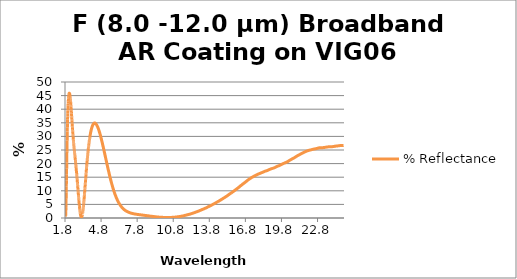
| Category | % Reflectance |
|---|---|
| 1.8 | 8.176 |
| 1.8045 | 6.008 |
| 1.809 | 6.008 |
| 1.8135 | 4.145 |
| 1.818 | 4.145 |
| 1.8225 | 2.639 |
| 1.827 | 2.639 |
| 1.8315 | 1.541 |
| 1.836 | 0.876 |
| 1.8405 | 0.876 |
| 1.845 | 0.646 |
| 1.8495 | 0.646 |
| 1.854 | 0.863 |
| 1.8585 | 0.863 |
| 1.863 | 1.5 |
| 1.8675 | 1.5 |
| 1.872 | 2.515 |
| 1.8765 | 3.852 |
| 1.881 | 3.852 |
| 1.8855 | 5.462 |
| 1.89 | 5.462 |
| 1.8945 | 7.306 |
| 1.899 | 7.306 |
| 1.9035 | 9.318 |
| 1.908 | 11.457 |
| 1.9125 | 11.457 |
| 1.917 | 13.661 |
| 1.9215 | 13.661 |
| 1.926 | 15.895 |
| 1.9305 | 15.895 |
| 1.935 | 18.127 |
| 1.9395 | 18.127 |
| 1.944 | 20.324 |
| 1.9485 | 22.457 |
| 1.953 | 22.457 |
| 1.9575 | 24.517 |
| 1.962 | 24.517 |
| 1.9665 | 26.492 |
| 1.971 | 26.492 |
| 1.9755 | 28.361 |
| 1.98 | 28.361 |
| 1.9845 | 30.129 |
| 1.989 | 31.787 |
| 1.9935 | 31.787 |
| 1.998 | 33.334 |
| 2.0025 | 33.334 |
| 2.007 | 34.782 |
| 2.0115 | 34.782 |
| 2.016 | 36.117 |
| 2.0205 | 37.343 |
| 2.025 | 37.343 |
| 2.0295 | 38.48 |
| 2.034 | 38.48 |
| 2.0385 | 39.507 |
| 2.043 | 39.507 |
| 2.0475 | 40.433 |
| 2.052 | 40.433 |
| 2.0565 | 41.287 |
| 2.061 | 42.053 |
| 2.0655 | 42.053 |
| 2.07 | 42.732 |
| 2.0745 | 42.732 |
| 2.079 | 43.341 |
| 2.0835 | 43.341 |
| 2.088 | 43.875 |
| 2.0925 | 43.875 |
| 2.097 | 44.337 |
| 2.1015 | 44.737 |
| 2.106 | 44.737 |
| 2.1105 | 45.065 |
| 2.115 | 45.065 |
| 2.1195 | 45.333 |
| 2.124 | 45.333 |
| 2.1285 | 45.549 |
| 2.133 | 45.549 |
| 2.1375 | 45.705 |
| 2.142 | 45.807 |
| 2.1465 | 45.807 |
| 2.151 | 45.859 |
| 2.1555 | 45.859 |
| 2.16 | 45.872 |
| 2.1645 | 45.872 |
| 2.169 | 45.84 |
| 2.1735 | 45.766 |
| 2.178 | 45.766 |
| 2.1825 | 45.649 |
| 2.187 | 45.649 |
| 2.1915 | 45.497 |
| 2.196 | 45.497 |
| 2.2005 | 45.314 |
| 2.205 | 45.314 |
| 2.2095 | 45.088 |
| 2.214 | 44.831 |
| 2.2185 | 44.831 |
| 2.223 | 44.545 |
| 2.2275 | 44.545 |
| 2.232 | 44.236 |
| 2.2365 | 44.236 |
| 2.241 | 43.904 |
| 2.2455 | 43.904 |
| 2.25 | 43.532 |
| 2.2545 | 43.142 |
| 2.259 | 43.142 |
| 2.2635 | 42.739 |
| 2.268 | 42.739 |
| 2.2725 | 42.312 |
| 2.277 | 42.312 |
| 2.2815 | 41.869 |
| 2.286 | 41.869 |
| 2.2905 | 41.413 |
| 2.295 | 40.936 |
| 2.2995 | 40.936 |
| 2.304 | 40.444 |
| 2.3085 | 40.444 |
| 2.313 | 39.944 |
| 2.3175 | 39.944 |
| 2.322 | 39.434 |
| 2.3265 | 38.918 |
| 2.331 | 38.918 |
| 2.3355 | 38.397 |
| 2.34 | 38.397 |
| 2.3445 | 37.876 |
| 2.349 | 37.876 |
| 2.3535 | 37.352 |
| 2.358 | 37.352 |
| 2.3625 | 36.82 |
| 2.367 | 36.288 |
| 2.3715 | 36.288 |
| 2.376 | 35.758 |
| 2.3805 | 35.758 |
| 2.385 | 35.231 |
| 2.3895 | 35.231 |
| 2.394 | 34.71 |
| 2.3985 | 34.71 |
| 2.403 | 34.192 |
| 2.4075 | 33.676 |
| 2.412 | 33.676 |
| 2.4165 | 33.169 |
| 2.421 | 33.169 |
| 2.4255 | 32.67 |
| 2.43 | 32.67 |
| 2.4345 | 32.178 |
| 2.439 | 32.178 |
| 2.4435 | 31.693 |
| 2.448 | 31.218 |
| 2.4525 | 31.218 |
| 2.457 | 30.751 |
| 2.4615 | 30.751 |
| 2.466 | 30.29 |
| 2.4705 | 30.29 |
| 2.475 | 29.841 |
| 2.4795 | 29.403 |
| 2.484 | 29.403 |
| 2.4885 | 28.973 |
| 2.493 | 28.973 |
| 2.4975 | 28.553 |
| 2.502 | 28.553 |
| 2.5065 | 28.14 |
| 2.511 | 28.14 |
| 2.5155 | 27.738 |
| 2.52 | 27.344 |
| 2.5245 | 27.344 |
| 2.529 | 26.956 |
| 2.5335 | 26.956 |
| 2.538 | 26.578 |
| 2.5425 | 26.578 |
| 2.547 | 26.21 |
| 2.5515 | 26.21 |
| 2.556 | 25.845 |
| 2.5605 | 25.482 |
| 2.565 | 25.482 |
| 2.5695 | 25.127 |
| 2.574 | 25.127 |
| 2.5785 | 24.782 |
| 2.583 | 24.782 |
| 2.5875 | 24.435 |
| 2.592 | 24.084 |
| 2.5965 | 24.084 |
| 2.601 | 23.74 |
| 2.6055 | 23.74 |
| 2.61 | 23.404 |
| 2.6145 | 23.404 |
| 2.619 | 23.064 |
| 2.6235 | 23.064 |
| 2.628 | 22.725 |
| 2.6325 | 22.384 |
| 2.637 | 22.384 |
| 2.6415 | 22.038 |
| 2.646 | 22.038 |
| 2.6505 | 21.698 |
| 2.655 | 21.698 |
| 2.6595 | 21.368 |
| 2.664 | 21.368 |
| 2.6685 | 21.024 |
| 2.673 | 20.661 |
| 2.6775 | 20.661 |
| 2.682 | 20.3 |
| 2.6865 | 20.3 |
| 2.691 | 19.932 |
| 2.6955 | 19.932 |
| 2.7 | 19.556 |
| 2.7045 | 19.556 |
| 2.709 | 19.181 |
| 2.7135 | 18.811 |
| 2.718 | 18.811 |
| 2.7225 | 18.431 |
| 2.727 | 18.431 |
| 2.7315 | 18.051 |
| 2.736 | 18.051 |
| 2.7405 | 17.668 |
| 2.745 | 17.28 |
| 2.7495 | 17.28 |
| 2.754 | 16.893 |
| 2.7585 | 16.893 |
| 2.763 | 16.5 |
| 2.7675 | 16.5 |
| 2.772 | 16.098 |
| 2.7765 | 16.098 |
| 2.781 | 15.693 |
| 2.7855 | 15.28 |
| 2.79 | 15.28 |
| 2.7945 | 14.866 |
| 2.799 | 14.866 |
| 2.8035 | 14.45 |
| 2.808 | 14.45 |
| 2.8125 | 14.028 |
| 2.817 | 14.028 |
| 2.8215 | 13.606 |
| 2.826 | 13.178 |
| 2.8305 | 13.178 |
| 2.835 | 12.745 |
| 2.8395 | 12.745 |
| 2.844 | 12.314 |
| 2.8485 | 12.314 |
| 2.853 | 11.879 |
| 2.8575 | 11.879 |
| 2.862 | 11.441 |
| 2.8665 | 11.006 |
| 2.871 | 11.006 |
| 2.8755 | 10.566 |
| 2.88 | 10.566 |
| 2.8845 | 10.126 |
| 2.889 | 10.126 |
| 2.8935 | 9.69 |
| 2.898 | 9.253 |
| 2.9025 | 9.253 |
| 2.907 | 8.819 |
| 2.9115 | 8.819 |
| 2.916 | 8.389 |
| 2.9205 | 8.389 |
| 2.925 | 7.959 |
| 2.9295 | 7.959 |
| 2.934 | 7.534 |
| 2.9385 | 7.112 |
| 2.943 | 7.112 |
| 2.9475 | 6.7 |
| 2.952 | 6.7 |
| 2.9565 | 6.294 |
| 2.961 | 6.294 |
| 2.9655 | 5.89 |
| 2.97 | 5.89 |
| 2.9745 | 5.495 |
| 2.979 | 5.114 |
| 2.9835 | 5.114 |
| 2.988 | 4.738 |
| 2.9925 | 4.738 |
| 2.997 | 4.373 |
| 3.0015 | 4.373 |
| 3.006 | 4.023 |
| 3.0105 | 4.023 |
| 3.015 | 3.678 |
| 3.0195 | 3.349 |
| 3.024 | 3.349 |
| 3.0285 | 3.037 |
| 3.033 | 3.037 |
| 3.0375 | 2.735 |
| 3.042 | 2.735 |
| 3.0465 | 2.448 |
| 3.051 | 2.178 |
| 3.0555 | 2.178 |
| 3.06 | 1.923 |
| 3.0645 | 1.923 |
| 3.069 | 1.684 |
| 3.0735 | 1.684 |
| 3.078 | 1.461 |
| 3.0825 | 1.461 |
| 3.087 | 1.254 |
| 3.0915 | 1.071 |
| 3.096 | 1.071 |
| 3.1005 | 0.907 |
| 3.105 | 0.907 |
| 3.1095 | 0.758 |
| 3.114 | 0.758 |
| 3.1185 | 0.63 |
| 3.123 | 0.63 |
| 3.1275 | 0.521 |
| 3.132 | 0.432 |
| 3.1365 | 0.432 |
| 3.141 | 0.365 |
| 3.1455 | 0.365 |
| 3.15 | 0.319 |
| 3.1545 | 0.319 |
| 3.159 | 0.292 |
| 3.1635 | 0.292 |
| 3.168 | 0.283 |
| 3.1725 | 0.299 |
| 3.177 | 0.299 |
| 3.1815 | 0.34 |
| 3.186 | 0.34 |
| 3.1905 | 0.396 |
| 3.195 | 0.396 |
| 3.1995 | 0.471 |
| 3.204 | 0.57 |
| 3.2085 | 0.57 |
| 3.213 | 0.686 |
| 3.2175 | 0.686 |
| 3.222 | 0.824 |
| 3.2265 | 0.824 |
| 3.231 | 0.983 |
| 3.2355 | 0.983 |
| 3.24 | 1.157 |
| 3.2445 | 1.348 |
| 3.249 | 1.348 |
| 3.2535 | 1.559 |
| 3.258 | 1.559 |
| 3.2625 | 1.788 |
| 3.267 | 1.788 |
| 3.2715 | 2.035 |
| 3.276 | 2.035 |
| 3.2805 | 2.3 |
| 3.285 | 2.578 |
| 3.2895 | 2.578 |
| 3.294 | 2.868 |
| 3.2985 | 2.868 |
| 3.303 | 3.175 |
| 3.3075 | 3.175 |
| 3.312 | 3.499 |
| 3.3165 | 3.835 |
| 3.321 | 3.835 |
| 3.3255 | 4.181 |
| 3.33 | 4.181 |
| 3.3345 | 4.542 |
| 3.339 | 4.542 |
| 3.3435 | 4.915 |
| 3.348 | 4.915 |
| 3.3525 | 5.293 |
| 3.357 | 5.684 |
| 3.3615 | 5.684 |
| 3.366 | 6.086 |
| 3.3705 | 6.086 |
| 3.375 | 6.493 |
| 3.3795 | 6.493 |
| 3.384 | 6.907 |
| 3.3885 | 6.907 |
| 3.393 | 7.33 |
| 3.3975 | 7.761 |
| 3.402 | 7.761 |
| 3.4065 | 8.194 |
| 3.411 | 8.194 |
| 3.4155 | 8.627 |
| 3.42 | 8.627 |
| 3.4245 | 9.065 |
| 3.429 | 9.065 |
| 3.4335 | 9.507 |
| 3.438 | 9.957 |
| 3.4425 | 9.957 |
| 3.447 | 10.413 |
| 3.4515 | 10.413 |
| 3.456 | 10.872 |
| 3.4605 | 10.872 |
| 3.465 | 11.332 |
| 3.4695 | 11.793 |
| 3.474 | 11.793 |
| 3.4785 | 12.256 |
| 3.483 | 12.256 |
| 3.4875 | 12.717 |
| 3.492 | 12.717 |
| 3.4965 | 13.175 |
| 3.501 | 13.175 |
| 3.5055 | 13.631 |
| 3.51 | 14.085 |
| 3.5145 | 14.085 |
| 3.519 | 14.544 |
| 3.5235 | 14.544 |
| 3.528 | 15.002 |
| 3.5325 | 15.002 |
| 3.537 | 15.454 |
| 3.5415 | 15.454 |
| 3.546 | 15.902 |
| 3.5505 | 16.35 |
| 3.555 | 16.35 |
| 3.5595 | 16.8 |
| 3.564 | 16.8 |
| 3.5685 | 17.242 |
| 3.573 | 17.242 |
| 3.5775 | 17.68 |
| 3.582 | 17.68 |
| 3.5865 | 18.112 |
| 3.591 | 18.539 |
| 3.5955 | 18.539 |
| 3.6 | 18.966 |
| 3.6045 | 18.966 |
| 3.609 | 19.386 |
| 3.6135 | 19.386 |
| 3.618 | 19.798 |
| 3.6225 | 20.207 |
| 3.627 | 20.207 |
| 3.6315 | 20.614 |
| 3.636 | 20.614 |
| 3.6405 | 21.015 |
| 3.645 | 21.015 |
| 3.6495 | 21.406 |
| 3.654 | 21.406 |
| 3.6585 | 21.794 |
| 3.663 | 22.179 |
| 3.6675 | 22.179 |
| 3.672 | 22.553 |
| 3.6765 | 22.553 |
| 3.681 | 22.921 |
| 3.6855 | 22.921 |
| 3.69 | 23.29 |
| 3.6945 | 23.29 |
| 3.699 | 23.65 |
| 3.7035 | 24.003 |
| 3.708 | 24.003 |
| 3.7125 | 24.349 |
| 3.717 | 24.349 |
| 3.7215 | 24.689 |
| 3.726 | 24.689 |
| 3.7305 | 25.021 |
| 3.735 | 25.021 |
| 3.7395 | 25.345 |
| 3.744 | 25.667 |
| 3.7485 | 25.667 |
| 3.753 | 25.986 |
| 3.7575 | 25.986 |
| 3.762 | 26.297 |
| 3.7665 | 26.297 |
| 3.771 | 26.6 |
| 3.7755 | 26.894 |
| 3.78 | 26.894 |
| 3.7845 | 27.185 |
| 3.789 | 27.185 |
| 3.7935 | 27.472 |
| 3.798 | 27.472 |
| 3.8025 | 27.752 |
| 3.807 | 27.752 |
| 3.8115 | 28.023 |
| 3.816 | 28.285 |
| 3.8205 | 28.285 |
| 3.825 | 28.545 |
| 3.8295 | 28.545 |
| 3.834 | 28.804 |
| 3.8385 | 28.804 |
| 3.843 | 29.055 |
| 3.8475 | 29.055 |
| 3.852 | 29.294 |
| 3.8565 | 29.528 |
| 3.861 | 29.528 |
| 3.8655 | 29.759 |
| 3.87 | 29.759 |
| 3.8745 | 29.983 |
| 3.879 | 29.983 |
| 3.8835 | 30.202 |
| 3.888 | 30.418 |
| 3.8925 | 30.418 |
| 3.897 | 30.622 |
| 3.9015 | 30.622 |
| 3.906 | 30.821 |
| 3.9105 | 30.821 |
| 3.915 | 31.018 |
| 3.9195 | 31.018 |
| 3.924 | 31.208 |
| 3.9285 | 31.393 |
| 3.933 | 31.393 |
| 3.9375 | 31.572 |
| 3.942 | 31.572 |
| 3.9465 | 31.745 |
| 3.951 | 31.745 |
| 3.9555 | 31.913 |
| 3.96 | 31.913 |
| 3.9645 | 32.072 |
| 3.969 | 32.225 |
| 3.9735 | 32.225 |
| 3.978 | 32.378 |
| 3.9825 | 32.378 |
| 3.987 | 32.527 |
| 3.9915 | 32.527 |
| 3.996 | 32.669 |
| 4.0005 | 32.669 |
| 4.005 | 32.806 |
| 4.0095 | 32.936 |
| 4.014 | 32.936 |
| 4.0185 | 33.063 |
| 4.023 | 33.063 |
| 4.0275 | 33.184 |
| 4.032 | 33.184 |
| 4.0365 | 33.301 |
| 4.041 | 33.413 |
| 4.0455 | 33.413 |
| 4.05 | 33.519 |
| 4.0545 | 33.519 |
| 4.059 | 33.621 |
| 4.0635 | 33.621 |
| 4.068 | 33.719 |
| 4.0725 | 33.719 |
| 4.077 | 33.811 |
| 4.0815 | 33.901 |
| 4.086 | 33.901 |
| 4.0905 | 33.987 |
| 4.095 | 33.987 |
| 4.0995 | 34.069 |
| 4.104 | 34.069 |
| 4.1085 | 34.146 |
| 4.113 | 34.146 |
| 4.1175 | 34.218 |
| 4.122 | 34.288 |
| 4.1265 | 34.288 |
| 4.131 | 34.352 |
| 4.1355 | 34.352 |
| 4.14 | 34.409 |
| 4.1445 | 34.409 |
| 4.149 | 34.464 |
| 4.1535 | 34.464 |
| 4.158 | 34.516 |
| 4.1625 | 34.564 |
| 4.167 | 34.564 |
| 4.1715 | 34.607 |
| 4.176 | 34.607 |
| 4.1805 | 34.65 |
| 4.185 | 34.65 |
| 4.1895 | 34.688 |
| 4.194 | 34.727 |
| 4.1985 | 34.727 |
| 4.203 | 34.773 |
| 4.2075 | 34.773 |
| 4.212 | 34.826 |
| 4.2165 | 34.826 |
| 4.221 | 34.879 |
| 4.2255 | 34.879 |
| 4.23 | 34.92 |
| 4.2345 | 34.934 |
| 4.239 | 34.934 |
| 4.2435 | 34.918 |
| 4.248 | 34.918 |
| 4.2525 | 34.898 |
| 4.257 | 34.898 |
| 4.2615 | 34.904 |
| 4.266 | 34.904 |
| 4.2705 | 34.928 |
| 4.275 | 34.935 |
| 4.2795 | 34.935 |
| 4.284 | 34.922 |
| 4.2885 | 34.922 |
| 4.293 | 34.901 |
| 4.2975 | 34.901 |
| 4.302 | 34.874 |
| 4.3065 | 34.874 |
| 4.311 | 34.843 |
| 4.3155 | 34.812 |
| 4.32 | 34.812 |
| 4.3245 | 34.78 |
| 4.329 | 34.78 |
| 4.3335 | 34.749 |
| 4.338 | 34.749 |
| 4.3425 | 34.715 |
| 4.347 | 34.679 |
| 4.3515 | 34.679 |
| 4.356 | 34.645 |
| 4.3605 | 34.645 |
| 4.365 | 34.61 |
| 4.3695 | 34.61 |
| 4.374 | 34.572 |
| 4.3785 | 34.572 |
| 4.383 | 34.529 |
| 4.3875 | 34.482 |
| 4.392 | 34.482 |
| 4.3965 | 34.435 |
| 4.401 | 34.435 |
| 4.4055 | 34.386 |
| 4.41 | 34.386 |
| 4.4145 | 34.332 |
| 4.419 | 34.332 |
| 4.4235 | 34.276 |
| 4.428 | 34.219 |
| 4.4325 | 34.219 |
| 4.437 | 34.157 |
| 4.4415 | 34.157 |
| 4.446 | 34.094 |
| 4.4505 | 34.094 |
| 4.455 | 34.032 |
| 4.4595 | 34.032 |
| 4.464 | 33.964 |
| 4.4685 | 33.892 |
| 4.473 | 33.892 |
| 4.4775 | 33.818 |
| 4.482 | 33.818 |
| 4.4865 | 33.741 |
| 4.491 | 33.741 |
| 4.4955 | 33.662 |
| 4.5 | 33.582 |
| 4.5045 | 33.582 |
| 4.509 | 33.503 |
| 4.5135 | 33.503 |
| 4.518 | 33.423 |
| 4.5225 | 33.423 |
| 4.527 | 33.337 |
| 4.5315 | 33.337 |
| 4.536 | 33.247 |
| 4.5405 | 33.157 |
| 4.545 | 33.157 |
| 4.5495 | 33.067 |
| 4.554 | 33.067 |
| 4.5585 | 32.976 |
| 4.563 | 32.976 |
| 4.5675 | 32.882 |
| 4.572 | 32.882 |
| 4.5765 | 32.783 |
| 4.581 | 32.683 |
| 4.5855 | 32.683 |
| 4.59 | 32.585 |
| 4.5945 | 32.585 |
| 4.599 | 32.483 |
| 4.6035 | 32.483 |
| 4.608 | 32.377 |
| 4.6125 | 32.27 |
| 4.617 | 32.27 |
| 4.6215 | 32.162 |
| 4.626 | 32.162 |
| 4.6305 | 32.049 |
| 4.635 | 32.049 |
| 4.6395 | 31.936 |
| 4.644 | 31.936 |
| 4.6485 | 31.825 |
| 4.653 | 31.709 |
| 4.6575 | 31.709 |
| 4.662 | 31.59 |
| 4.6665 | 31.59 |
| 4.671 | 31.472 |
| 4.6755 | 31.472 |
| 4.68 | 31.356 |
| 4.6845 | 31.356 |
| 4.689 | 31.234 |
| 4.6935 | 31.109 |
| 4.698 | 31.109 |
| 4.7025 | 30.984 |
| 4.707 | 30.984 |
| 4.7115 | 30.86 |
| 4.716 | 30.86 |
| 4.7205 | 30.734 |
| 4.725 | 30.734 |
| 4.7295 | 30.606 |
| 4.734 | 30.478 |
| 4.7385 | 30.478 |
| 4.743 | 30.348 |
| 4.7475 | 30.348 |
| 4.752 | 30.215 |
| 4.7565 | 30.215 |
| 4.761 | 30.081 |
| 4.7655 | 29.947 |
| 4.77 | 29.947 |
| 4.7745 | 29.812 |
| 4.779 | 29.812 |
| 4.7835 | 29.673 |
| 4.788 | 29.673 |
| 4.7925 | 29.532 |
| 4.797 | 29.532 |
| 4.8015 | 29.39 |
| 4.806 | 29.249 |
| 4.8105 | 29.249 |
| 4.815 | 29.108 |
| 4.8195 | 29.108 |
| 4.824 | 28.966 |
| 4.8285 | 28.966 |
| 4.833 | 28.822 |
| 4.8375 | 28.822 |
| 4.842 | 28.677 |
| 4.8465 | 28.529 |
| 4.851 | 28.529 |
| 4.8555 | 28.381 |
| 4.86 | 28.381 |
| 4.8645 | 28.234 |
| 4.869 | 28.234 |
| 4.8735 | 28.086 |
| 4.878 | 28.086 |
| 4.8825 | 27.937 |
| 4.887 | 27.787 |
| 4.8915 | 27.787 |
| 4.896 | 27.639 |
| 4.9005 | 27.639 |
| 4.905 | 27.489 |
| 4.9095 | 27.489 |
| 4.914 | 27.335 |
| 4.9185 | 27.18 |
| 4.923 | 27.18 |
| 4.9275 | 27.024 |
| 4.932 | 27.024 |
| 4.9365 | 26.869 |
| 4.941 | 26.869 |
| 4.9455 | 26.716 |
| 4.95 | 26.716 |
| 4.9545 | 26.561 |
| 4.959 | 26.404 |
| 4.9635 | 26.404 |
| 4.968 | 26.248 |
| 4.9725 | 26.248 |
| 4.977 | 26.092 |
| 4.9815 | 26.092 |
| 4.986 | 25.934 |
| 4.9905 | 25.934 |
| 4.995 | 25.774 |
| 4.9995 | 25.614 |
| 5.004 | 25.614 |
| 5.0085 | 25.455 |
| 5.013 | 25.455 |
| 5.0175 | 25.295 |
| 5.022 | 25.295 |
| 5.0265 | 25.133 |
| 5.031 | 25.133 |
| 5.0355 | 24.971 |
| 5.04 | 24.811 |
| 5.0445 | 24.811 |
| 5.049 | 24.651 |
| 5.0535 | 24.651 |
| 5.058 | 24.489 |
| 5.0625 | 24.489 |
| 5.067 | 24.327 |
| 5.0715 | 24.166 |
| 5.076 | 24.166 |
| 5.0805 | 24.003 |
| 5.085 | 24.003 |
| 5.0895 | 23.841 |
| 5.094 | 23.841 |
| 5.0985 | 23.679 |
| 5.103 | 23.679 |
| 5.1075 | 23.517 |
| 5.112 | 23.355 |
| 5.1165 | 23.355 |
| 5.121 | 23.194 |
| 5.1255 | 23.194 |
| 5.13 | 23.032 |
| 5.1345 | 23.032 |
| 5.139 | 22.87 |
| 5.1435 | 22.87 |
| 5.148 | 22.706 |
| 5.1525 | 22.54 |
| 5.157 | 22.54 |
| 5.1615 | 22.375 |
| 5.166 | 22.375 |
| 5.1705 | 22.215 |
| 5.175 | 22.215 |
| 5.1795 | 22.054 |
| 5.184 | 21.89 |
| 5.1885 | 21.89 |
| 5.193 | 21.726 |
| 5.1975 | 21.726 |
| 5.202 | 21.563 |
| 5.2065 | 21.563 |
| 5.211 | 21.4 |
| 5.2155 | 21.4 |
| 5.22 | 21.239 |
| 5.2245 | 21.078 |
| 5.229 | 21.078 |
| 5.2335 | 20.916 |
| 5.238 | 20.916 |
| 5.2425 | 20.755 |
| 5.247 | 20.755 |
| 5.2515 | 20.593 |
| 5.256 | 20.593 |
| 5.2605 | 20.432 |
| 5.265 | 20.272 |
| 5.2695 | 20.272 |
| 5.274 | 20.112 |
| 5.2785 | 20.112 |
| 5.283 | 19.951 |
| 5.2875 | 19.951 |
| 5.292 | 19.79 |
| 5.2965 | 19.79 |
| 5.301 | 19.629 |
| 5.3055 | 19.469 |
| 5.31 | 19.469 |
| 5.3145 | 19.31 |
| 5.319 | 19.31 |
| 5.3235 | 19.151 |
| 5.328 | 19.151 |
| 5.3325 | 18.992 |
| 5.337 | 18.835 |
| 5.3415 | 18.835 |
| 5.346 | 18.678 |
| 5.3505 | 18.678 |
| 5.355 | 18.52 |
| 5.3595 | 18.52 |
| 5.364 | 18.361 |
| 5.3685 | 18.361 |
| 5.373 | 18.203 |
| 5.3775 | 18.044 |
| 5.382 | 18.044 |
| 5.3865 | 17.887 |
| 5.391 | 17.887 |
| 5.3955 | 17.734 |
| 5.4 | 17.734 |
| 5.4045 | 17.583 |
| 5.409 | 17.583 |
| 5.4135 | 17.432 |
| 5.418 | 17.278 |
| 5.4225 | 17.278 |
| 5.427 | 17.121 |
| 5.4315 | 17.121 |
| 5.436 | 16.966 |
| 5.4405 | 16.966 |
| 5.445 | 16.813 |
| 5.4495 | 16.813 |
| 5.454 | 16.662 |
| 5.4585 | 16.513 |
| 5.463 | 16.513 |
| 5.4675 | 16.363 |
| 5.472 | 16.363 |
| 5.4765 | 16.212 |
| 5.481 | 16.212 |
| 5.4855 | 16.059 |
| 5.49 | 15.908 |
| 5.4945 | 15.908 |
| 5.499 | 15.762 |
| 5.5035 | 15.762 |
| 5.508 | 15.618 |
| 5.5125 | 15.618 |
| 5.517 | 15.473 |
| 5.5215 | 15.473 |
| 5.526 | 15.326 |
| 5.5305 | 15.178 |
| 5.535 | 15.178 |
| 5.5395 | 15.035 |
| 5.544 | 15.035 |
| 5.5485 | 14.894 |
| 5.553 | 14.894 |
| 5.5575 | 14.754 |
| 5.562 | 14.754 |
| 5.5665 | 14.616 |
| 5.571 | 14.475 |
| 5.5755 | 14.475 |
| 5.58 | 14.33 |
| 5.5845 | 14.33 |
| 5.589 | 14.186 |
| 5.5935 | 14.186 |
| 5.598 | 14.048 |
| 5.6025 | 14.048 |
| 5.607 | 13.91 |
| 5.6115 | 13.771 |
| 5.616 | 13.771 |
| 5.6205 | 13.635 |
| 5.625 | 13.635 |
| 5.6295 | 13.504 |
| 5.634 | 13.504 |
| 5.6385 | 13.373 |
| 5.643 | 13.237 |
| 5.6475 | 13.237 |
| 5.652 | 13.099 |
| 5.6565 | 13.099 |
| 5.661 | 12.965 |
| 5.6655 | 12.965 |
| 5.67 | 12.834 |
| 5.6745 | 12.834 |
| 5.679 | 12.703 |
| 5.6835 | 12.574 |
| 5.688 | 12.574 |
| 5.6925 | 12.446 |
| 5.697 | 12.446 |
| 5.7015 | 12.32 |
| 5.706 | 12.32 |
| 5.7105 | 12.192 |
| 5.715 | 12.192 |
| 5.7195 | 12.061 |
| 5.724 | 11.933 |
| 5.7285 | 11.933 |
| 5.733 | 11.809 |
| 5.7375 | 11.809 |
| 5.742 | 11.687 |
| 5.7465 | 11.687 |
| 5.751 | 11.566 |
| 5.7555 | 11.566 |
| 5.76 | 11.449 |
| 5.7645 | 11.328 |
| 5.769 | 11.328 |
| 5.7735 | 11.202 |
| 5.778 | 11.202 |
| 5.7825 | 11.079 |
| 5.787 | 11.079 |
| 5.7915 | 10.96 |
| 5.796 | 10.844 |
| 5.8005 | 10.844 |
| 5.805 | 10.734 |
| 5.8095 | 10.734 |
| 5.814 | 10.626 |
| 5.8185 | 10.626 |
| 5.823 | 10.509 |
| 5.8275 | 10.509 |
| 5.832 | 10.387 |
| 5.8365 | 10.272 |
| 5.841 | 10.272 |
| 5.8455 | 10.163 |
| 5.85 | 10.163 |
| 5.8545 | 10.056 |
| 5.859 | 10.056 |
| 5.8635 | 9.948 |
| 5.868 | 9.948 |
| 5.8725 | 9.841 |
| 5.877 | 9.733 |
| 5.8815 | 9.733 |
| 5.886 | 9.62 |
| 5.8905 | 9.62 |
| 5.895 | 9.506 |
| 5.8995 | 9.506 |
| 5.904 | 9.397 |
| 5.9085 | 9.295 |
| 5.913 | 9.295 |
| 5.9175 | 9.198 |
| 5.922 | 9.198 |
| 5.9265 | 9.102 |
| 5.931 | 9.102 |
| 5.9355 | 8.997 |
| 5.94 | 8.997 |
| 5.9445 | 8.89 |
| 5.949 | 8.789 |
| 5.9535 | 8.789 |
| 5.958 | 8.693 |
| 5.9625 | 8.693 |
| 5.967 | 8.594 |
| 5.9715 | 8.594 |
| 5.976 | 8.495 |
| 5.9805 | 8.495 |
| 5.985 | 8.397 |
| 5.9895 | 8.299 |
| 5.994 | 8.299 |
| 5.9985 | 8.206 |
| 6.003 | 8.206 |
| 6.0075 | 8.116 |
| 6.012 | 8.116 |
| 6.0165 | 8.026 |
| 6.021 | 8.026 |
| 6.0255 | 7.938 |
| 6.03 | 7.855 |
| 6.0345 | 7.855 |
| 6.039 | 7.77 |
| 6.0435 | 7.77 |
| 6.048 | 7.676 |
| 6.0525 | 7.676 |
| 6.057 | 7.582 |
| 6.0615 | 7.496 |
| 6.066 | 7.496 |
| 6.0705 | 7.411 |
| 6.075 | 7.411 |
| 6.0795 | 7.324 |
| 6.084 | 7.324 |
| 6.0885 | 7.239 |
| 6.093 | 7.239 |
| 6.0975 | 7.16 |
| 6.102 | 7.081 |
| 6.1065 | 7.081 |
| 6.111 | 7 |
| 6.1155 | 7 |
| 6.12 | 6.918 |
| 6.1245 | 6.918 |
| 6.129 | 6.84 |
| 6.1335 | 6.84 |
| 6.138 | 6.763 |
| 6.1425 | 6.686 |
| 6.147 | 6.686 |
| 6.1515 | 6.608 |
| 6.156 | 6.608 |
| 6.1605 | 6.53 |
| 6.165 | 6.53 |
| 6.1695 | 6.456 |
| 6.174 | 6.456 |
| 6.1785 | 6.385 |
| 6.183 | 6.313 |
| 6.1875 | 6.313 |
| 6.192 | 6.239 |
| 6.1965 | 6.239 |
| 6.201 | 6.166 |
| 6.2055 | 6.166 |
| 6.21 | 6.095 |
| 6.2145 | 6.024 |
| 6.219 | 6.024 |
| 6.2235 | 5.955 |
| 6.228 | 5.955 |
| 6.2325 | 5.886 |
| 6.237 | 5.886 |
| 6.2415 | 5.818 |
| 6.246 | 5.818 |
| 6.2505 | 5.751 |
| 6.255 | 5.686 |
| 6.2595 | 5.686 |
| 6.264 | 5.621 |
| 6.2685 | 5.621 |
| 6.273 | 5.556 |
| 6.2775 | 5.556 |
| 6.282 | 5.492 |
| 6.2865 | 5.492 |
| 6.291 | 5.43 |
| 6.2955 | 5.367 |
| 6.3 | 5.367 |
| 6.3045 | 5.305 |
| 6.309 | 5.305 |
| 6.3135 | 5.246 |
| 6.318 | 5.246 |
| 6.3225 | 5.19 |
| 6.327 | 5.19 |
| 6.3315 | 5.136 |
| 6.336 | 5.081 |
| 6.3405 | 5.081 |
| 6.345 | 5.024 |
| 6.3495 | 5.024 |
| 6.354 | 4.967 |
| 6.3585 | 4.967 |
| 6.363 | 4.912 |
| 6.3675 | 4.859 |
| 6.372 | 4.859 |
| 6.3765 | 4.805 |
| 6.381 | 4.805 |
| 6.3855 | 4.754 |
| 6.39 | 4.754 |
| 6.3945 | 4.706 |
| 6.399 | 4.706 |
| 6.4035 | 4.658 |
| 6.408 | 4.605 |
| 6.4125 | 4.605 |
| 6.417 | 4.549 |
| 6.4215 | 4.549 |
| 6.426 | 4.493 |
| 6.4305 | 4.493 |
| 6.435 | 4.443 |
| 6.4395 | 4.443 |
| 6.444 | 4.398 |
| 6.4485 | 4.355 |
| 6.453 | 4.355 |
| 6.4575 | 4.312 |
| 6.462 | 4.312 |
| 6.4665 | 4.268 |
| 6.471 | 4.268 |
| 6.4755 | 4.223 |
| 6.48 | 4.178 |
| 6.4845 | 4.178 |
| 6.489 | 4.133 |
| 6.4935 | 4.133 |
| 6.498 | 4.087 |
| 6.5025 | 4.087 |
| 6.507 | 4.043 |
| 6.5115 | 4.043 |
| 6.516 | 4.001 |
| 6.5205 | 3.96 |
| 6.525 | 3.96 |
| 6.5295 | 3.92 |
| 6.534 | 3.92 |
| 6.5385 | 3.882 |
| 6.543 | 3.882 |
| 6.5475 | 3.844 |
| 6.552 | 3.844 |
| 6.5565 | 3.805 |
| 6.561 | 3.766 |
| 6.5655 | 3.766 |
| 6.57 | 3.725 |
| 6.5745 | 3.725 |
| 6.579 | 3.685 |
| 6.5835 | 3.685 |
| 6.588 | 3.645 |
| 6.5925 | 3.645 |
| 6.597 | 3.606 |
| 6.6015 | 3.568 |
| 6.606 | 3.568 |
| 6.6105 | 3.532 |
| 6.615 | 3.532 |
| 6.6195 | 3.497 |
| 6.624 | 3.497 |
| 6.6285 | 3.464 |
| 6.633 | 3.428 |
| 6.6375 | 3.428 |
| 6.642 | 3.39 |
| 6.6465 | 3.39 |
| 6.651 | 3.354 |
| 6.6555 | 3.354 |
| 6.66 | 3.322 |
| 6.6645 | 3.322 |
| 6.669 | 3.292 |
| 6.6735 | 3.261 |
| 6.678 | 3.261 |
| 6.6825 | 3.228 |
| 6.687 | 3.228 |
| 6.6915 | 3.197 |
| 6.696 | 3.197 |
| 6.7005 | 3.166 |
| 6.705 | 3.166 |
| 6.7095 | 3.135 |
| 6.714 | 3.103 |
| 6.7185 | 3.103 |
| 6.723 | 3.071 |
| 6.7275 | 3.071 |
| 6.732 | 3.04 |
| 6.7365 | 3.04 |
| 6.741 | 3.011 |
| 6.7455 | 3.011 |
| 6.75 | 2.985 |
| 6.7545 | 2.96 |
| 6.759 | 2.96 |
| 6.7635 | 2.936 |
| 6.768 | 2.936 |
| 6.7725 | 2.911 |
| 6.777 | 2.911 |
| 6.7815 | 2.883 |
| 6.786 | 2.854 |
| 6.7905 | 2.854 |
| 6.795 | 2.826 |
| 6.7995 | 2.826 |
| 6.804 | 2.799 |
| 6.8085 | 2.799 |
| 6.813 | 2.774 |
| 6.8175 | 2.774 |
| 6.822 | 2.75 |
| 6.8265 | 2.727 |
| 6.831 | 2.727 |
| 6.8355 | 2.705 |
| 6.84 | 2.705 |
| 6.8445 | 2.683 |
| 6.849 | 2.683 |
| 6.8535 | 2.662 |
| 6.858 | 2.662 |
| 6.8625 | 2.639 |
| 6.867 | 2.615 |
| 6.8715 | 2.615 |
| 6.876 | 2.591 |
| 6.8805 | 2.591 |
| 6.885 | 2.569 |
| 6.8895 | 2.569 |
| 6.894 | 2.549 |
| 6.8985 | 2.549 |
| 6.903 | 2.531 |
| 6.9075 | 2.512 |
| 6.912 | 2.512 |
| 6.9165 | 2.492 |
| 6.921 | 2.492 |
| 6.9255 | 2.472 |
| 6.93 | 2.472 |
| 6.9345 | 2.452 |
| 6.939 | 2.434 |
| 6.9435 | 2.434 |
| 6.948 | 2.417 |
| 6.9525 | 2.417 |
| 6.957 | 2.398 |
| 6.9615 | 2.398 |
| 6.966 | 2.378 |
| 6.9705 | 2.378 |
| 6.975 | 2.357 |
| 6.9795 | 2.338 |
| 6.984 | 2.338 |
| 6.9885 | 2.319 |
| 6.993 | 2.319 |
| 6.9975 | 2.302 |
| 7.002 | 2.302 |
| 7.0065 | 2.286 |
| 7.011 | 2.286 |
| 7.0155 | 2.27 |
| 7.02 | 2.254 |
| 7.0245 | 2.254 |
| 7.029 | 2.237 |
| 7.0335 | 2.237 |
| 7.038 | 2.22 |
| 7.0425 | 2.22 |
| 7.047 | 2.202 |
| 7.0515 | 2.202 |
| 7.056 | 2.185 |
| 7.0605 | 2.17 |
| 7.065 | 2.17 |
| 7.0695 | 2.154 |
| 7.074 | 2.154 |
| 7.0785 | 2.139 |
| 7.083 | 2.139 |
| 7.0875 | 2.123 |
| 7.092 | 2.108 |
| 7.0965 | 2.108 |
| 7.101 | 2.092 |
| 7.1055 | 2.092 |
| 7.11 | 2.077 |
| 7.1145 | 2.077 |
| 7.119 | 2.063 |
| 7.1235 | 2.063 |
| 7.128 | 2.049 |
| 7.1325 | 2.036 |
| 7.137 | 2.036 |
| 7.1415 | 2.024 |
| 7.146 | 2.024 |
| 7.1505 | 2.011 |
| 7.155 | 2.011 |
| 7.1595 | 1.999 |
| 7.164 | 1.999 |
| 7.1685 | 1.987 |
| 7.173 | 1.975 |
| 7.1775 | 1.975 |
| 7.182 | 1.962 |
| 7.1865 | 1.962 |
| 7.191 | 1.948 |
| 7.1955 | 1.948 |
| 7.2 | 1.933 |
| 7.2045 | 1.918 |
| 7.209 | 1.918 |
| 7.2135 | 1.905 |
| 7.218 | 1.905 |
| 7.2225 | 1.892 |
| 7.227 | 1.892 |
| 7.2315 | 1.881 |
| 7.236 | 1.881 |
| 7.2405 | 1.87 |
| 7.245 | 1.858 |
| 7.2495 | 1.858 |
| 7.254 | 1.846 |
| 7.2585 | 1.846 |
| 7.263 | 1.834 |
| 7.2675 | 1.834 |
| 7.272 | 1.821 |
| 7.2765 | 1.821 |
| 7.281 | 1.81 |
| 7.2855 | 1.799 |
| 7.29 | 1.799 |
| 7.2945 | 1.787 |
| 7.299 | 1.787 |
| 7.3035 | 1.775 |
| 7.308 | 1.775 |
| 7.3125 | 1.763 |
| 7.317 | 1.763 |
| 7.3215 | 1.751 |
| 7.326 | 1.741 |
| 7.3305 | 1.741 |
| 7.335 | 1.732 |
| 7.3395 | 1.732 |
| 7.344 | 1.723 |
| 7.3485 | 1.723 |
| 7.353 | 1.713 |
| 7.3575 | 1.703 |
| 7.362 | 1.703 |
| 7.3665 | 1.693 |
| 7.371 | 1.693 |
| 7.3755 | 1.685 |
| 7.38 | 1.685 |
| 7.3845 | 1.677 |
| 7.389 | 1.677 |
| 7.3935 | 1.669 |
| 7.398 | 1.661 |
| 7.4025 | 1.661 |
| 7.407 | 1.652 |
| 7.4115 | 1.652 |
| 7.416 | 1.642 |
| 7.4205 | 1.642 |
| 7.425 | 1.633 |
| 7.4295 | 1.633 |
| 7.434 | 1.624 |
| 7.4385 | 1.615 |
| 7.443 | 1.615 |
| 7.4475 | 1.606 |
| 7.452 | 1.606 |
| 7.4565 | 1.597 |
| 7.461 | 1.597 |
| 7.4655 | 1.587 |
| 7.47 | 1.587 |
| 7.4745 | 1.578 |
| 7.479 | 1.57 |
| 7.4835 | 1.57 |
| 7.488 | 1.563 |
| 7.4925 | 1.563 |
| 7.497 | 1.557 |
| 7.5015 | 1.557 |
| 7.506 | 1.551 |
| 7.5105 | 1.544 |
| 7.515 | 1.544 |
| 7.5195 | 1.538 |
| 7.524 | 1.538 |
| 7.5285 | 1.53 |
| 7.533 | 1.53 |
| 7.5375 | 1.523 |
| 7.542 | 1.523 |
| 7.5465 | 1.515 |
| 7.551 | 1.508 |
| 7.5555 | 1.508 |
| 7.56 | 1.501 |
| 7.5645 | 1.501 |
| 7.569 | 1.495 |
| 7.5735 | 1.495 |
| 7.578 | 1.488 |
| 7.5825 | 1.488 |
| 7.587 | 1.482 |
| 7.5915 | 1.476 |
| 7.596 | 1.476 |
| 7.6005 | 1.471 |
| 7.605 | 1.471 |
| 7.6095 | 1.465 |
| 7.614 | 1.465 |
| 7.6185 | 1.459 |
| 7.623 | 1.459 |
| 7.6275 | 1.453 |
| 7.632 | 1.447 |
| 7.6365 | 1.447 |
| 7.641 | 1.441 |
| 7.6455 | 1.441 |
| 7.65 | 1.435 |
| 7.6545 | 1.435 |
| 7.659 | 1.429 |
| 7.6635 | 1.424 |
| 7.668 | 1.424 |
| 7.6725 | 1.42 |
| 7.677 | 1.42 |
| 7.6815 | 1.415 |
| 7.686 | 1.415 |
| 7.6905 | 1.41 |
| 7.695 | 1.41 |
| 7.6995 | 1.404 |
| 7.704 | 1.398 |
| 7.7085 | 1.398 |
| 7.713 | 1.392 |
| 7.7175 | 1.392 |
| 7.722 | 1.386 |
| 7.7265 | 1.386 |
| 7.731 | 1.381 |
| 7.7355 | 1.381 |
| 7.74 | 1.376 |
| 7.7445 | 1.371 |
| 7.749 | 1.371 |
| 7.7535 | 1.365 |
| 7.758 | 1.365 |
| 7.7625 | 1.358 |
| 7.767 | 1.358 |
| 7.7715 | 1.352 |
| 7.776 | 1.346 |
| 7.7805 | 1.346 |
| 7.785 | 1.341 |
| 7.7895 | 1.341 |
| 7.794 | 1.336 |
| 7.7985 | 1.336 |
| 7.803 | 1.331 |
| 7.8075 | 1.331 |
| 7.812 | 1.326 |
| 7.8165 | 1.321 |
| 7.821 | 1.321 |
| 7.8255 | 1.316 |
| 7.83 | 1.316 |
| 7.8345 | 1.312 |
| 7.839 | 1.312 |
| 7.8435 | 1.307 |
| 7.848 | 1.307 |
| 7.8525 | 1.301 |
| 7.857 | 1.296 |
| 7.8615 | 1.296 |
| 7.866 | 1.29 |
| 7.8705 | 1.29 |
| 7.875 | 1.285 |
| 7.8795 | 1.285 |
| 7.884 | 1.28 |
| 7.8885 | 1.28 |
| 7.893 | 1.276 |
| 7.8975 | 1.272 |
| 7.902 | 1.272 |
| 7.9065 | 1.268 |
| 7.911 | 1.268 |
| 7.9155 | 1.264 |
| 7.92 | 1.264 |
| 7.9245 | 1.26 |
| 7.929 | 1.254 |
| 7.9335 | 1.254 |
| 7.938 | 1.248 |
| 7.9425 | 1.248 |
| 7.947 | 1.242 |
| 7.9515 | 1.242 |
| 7.956 | 1.236 |
| 7.9605 | 1.236 |
| 7.965 | 1.23 |
| 7.9695 | 1.224 |
| 7.974 | 1.224 |
| 7.9785 | 1.218 |
| 7.983 | 1.218 |
| 7.9875 | 1.214 |
| 7.992 | 1.214 |
| 7.9965 | 1.209 |
| 8.001 | 1.209 |
| 8.0055 | 1.205 |
| 8.01 | 1.201 |
| 8.0145 | 1.201 |
| 8.019 | 1.197 |
| 8.0235 | 1.197 |
| 8.028 | 1.193 |
| 8.0325 | 1.193 |
| 8.037 | 1.189 |
| 8.0415 | 1.189 |
| 8.046 | 1.184 |
| 8.0505 | 1.179 |
| 8.055 | 1.179 |
| 8.0595 | 1.173 |
| 8.064 | 1.173 |
| 8.0685 | 1.168 |
| 8.073 | 1.168 |
| 8.0775 | 1.163 |
| 8.082 | 1.159 |
| 8.0865 | 1.159 |
| 8.091 | 1.156 |
| 8.0955 | 1.156 |
| 8.1 | 1.152 |
| 8.1045 | 1.152 |
| 8.109 | 1.147 |
| 8.1135 | 1.147 |
| 8.118 | 1.142 |
| 8.1225 | 1.137 |
| 8.127 | 1.137 |
| 8.1315 | 1.131 |
| 8.136 | 1.131 |
| 8.1405 | 1.126 |
| 8.145 | 1.126 |
| 8.1495 | 1.12 |
| 8.154 | 1.12 |
| 8.1585 | 1.115 |
| 8.163 | 1.109 |
| 8.1675 | 1.109 |
| 8.172 | 1.104 |
| 8.1765 | 1.104 |
| 8.181 | 1.098 |
| 8.1855 | 1.098 |
| 8.19 | 1.092 |
| 8.1945 | 1.092 |
| 8.199 | 1.088 |
| 8.2035 | 1.084 |
| 8.208 | 1.084 |
| 8.2125 | 1.082 |
| 8.217 | 1.082 |
| 8.2215 | 1.08 |
| 8.226 | 1.08 |
| 8.2305 | 1.077 |
| 8.235 | 1.074 |
| 8.2395 | 1.074 |
| 8.244 | 1.069 |
| 8.2485 | 1.069 |
| 8.253 | 1.064 |
| 8.2575 | 1.064 |
| 8.262 | 1.057 |
| 8.2665 | 1.057 |
| 8.271 | 1.051 |
| 8.2755 | 1.046 |
| 8.28 | 1.046 |
| 8.2845 | 1.042 |
| 8.289 | 1.042 |
| 8.2935 | 1.039 |
| 8.298 | 1.039 |
| 8.3025 | 1.036 |
| 8.307 | 1.036 |
| 8.3115 | 1.033 |
| 8.316 | 1.029 |
| 8.3205 | 1.029 |
| 8.325 | 1.024 |
| 8.3295 | 1.024 |
| 8.334 | 1.018 |
| 8.3385 | 1.018 |
| 8.343 | 1.013 |
| 8.3475 | 1.009 |
| 8.352 | 1.006 |
| 8.3565 | 1 |
| 8.361 | 1 |
| 8.3655 | 0.994 |
| 8.37 | 0.994 |
| 8.3745 | 0.989 |
| 8.379 | 0.989 |
| 8.3835 | 0.984 |
| 8.388 | 0.981 |
| 8.3925 | 0.981 |
| 8.397 | 0.977 |
| 8.4015 | 0.977 |
| 8.406 | 0.972 |
| 8.4105 | 0.972 |
| 8.415 | 0.968 |
| 8.4195 | 0.968 |
| 8.424 | 0.964 |
| 8.4285 | 0.96 |
| 8.433 | 0.96 |
| 8.4375 | 0.956 |
| 8.442 | 0.956 |
| 8.4465 | 0.952 |
| 8.451 | 0.952 |
| 8.4555 | 0.946 |
| 8.46 | 0.946 |
| 8.4645 | 0.94 |
| 8.469 | 0.932 |
| 8.4735 | 0.932 |
| 8.478 | 0.925 |
| 8.4825 | 0.925 |
| 8.487 | 0.918 |
| 8.4915 | 0.918 |
| 8.496 | 0.912 |
| 8.5005 | 0.909 |
| 8.505 | 0.909 |
| 8.5095 | 0.906 |
| 8.514 | 0.906 |
| 8.5185 | 0.904 |
| 8.523 | 0.904 |
| 8.5275 | 0.903 |
| 8.532 | 0.903 |
| 8.5365 | 0.901 |
| 8.541 | 0.898 |
| 8.5455 | 0.898 |
| 8.55 | 0.894 |
| 8.5545 | 0.894 |
| 8.559 | 0.888 |
| 8.5635 | 0.888 |
| 8.568 | 0.882 |
| 8.5725 | 0.882 |
| 8.577 | 0.875 |
| 8.5815 | 0.868 |
| 8.586 | 0.868 |
| 8.5905 | 0.861 |
| 8.595 | 0.861 |
| 8.5995 | 0.855 |
| 8.604 | 0.855 |
| 8.6085 | 0.85 |
| 8.613 | 0.85 |
| 8.6175 | 0.845 |
| 8.622 | 0.841 |
| 8.6265 | 0.841 |
| 8.631 | 0.837 |
| 8.6355 | 0.837 |
| 8.64 | 0.833 |
| 8.6445 | 0.833 |
| 8.649 | 0.828 |
| 8.6535 | 0.824 |
| 8.658 | 0.824 |
| 8.6625 | 0.82 |
| 8.667 | 0.82 |
| 8.6715 | 0.817 |
| 8.676 | 0.817 |
| 8.6805 | 0.814 |
| 8.685 | 0.814 |
| 8.6895 | 0.81 |
| 8.694 | 0.807 |
| 8.6985 | 0.807 |
| 8.703 | 0.803 |
| 8.7075 | 0.803 |
| 8.712 | 0.799 |
| 8.7165 | 0.799 |
| 8.721 | 0.795 |
| 8.7255 | 0.795 |
| 8.73 | 0.792 |
| 8.7345 | 0.788 |
| 8.739 | 0.788 |
| 8.7435 | 0.785 |
| 8.748 | 0.785 |
| 8.7525 | 0.781 |
| 8.757 | 0.781 |
| 8.7615 | 0.775 |
| 8.766 | 0.775 |
| 8.7705 | 0.769 |
| 8.775 | 0.763 |
| 8.7795 | 0.763 |
| 8.784 | 0.756 |
| 8.7885 | 0.756 |
| 8.793 | 0.75 |
| 8.7975 | 0.75 |
| 8.802 | 0.744 |
| 8.8065 | 0.739 |
| 8.811 | 0.739 |
| 8.8155 | 0.735 |
| 8.82 | 0.735 |
| 8.8245 | 0.731 |
| 8.829 | 0.731 |
| 8.8335 | 0.726 |
| 8.838 | 0.726 |
| 8.8425 | 0.721 |
| 8.847 | 0.715 |
| 8.8515 | 0.715 |
| 8.856 | 0.708 |
| 8.8605 | 0.708 |
| 8.865 | 0.702 |
| 8.8695 | 0.702 |
| 8.874 | 0.696 |
| 8.8785 | 0.696 |
| 8.883 | 0.692 |
| 8.8875 | 0.689 |
| 8.892 | 0.689 |
| 8.8965 | 0.688 |
| 8.901 | 0.688 |
| 8.9055 | 0.686 |
| 8.91 | 0.686 |
| 8.9145 | 0.684 |
| 8.919 | 0.684 |
| 8.9235 | 0.68 |
| 8.928 | 0.676 |
| 8.9325 | 0.676 |
| 8.937 | 0.67 |
| 8.9415 | 0.67 |
| 8.946 | 0.665 |
| 8.9505 | 0.665 |
| 8.955 | 0.659 |
| 8.9595 | 0.653 |
| 8.964 | 0.653 |
| 8.9685 | 0.647 |
| 8.973 | 0.647 |
| 8.9775 | 0.642 |
| 8.982 | 0.642 |
| 8.9865 | 0.638 |
| 8.991 | 0.638 |
| 8.9955 | 0.635 |
| 9.0 | 0.632 |
| 9.0045 | 0.632 |
| 9.009 | 0.629 |
| 9.0135 | 0.629 |
| 9.018 | 0.625 |
| 9.0225 | 0.625 |
| 9.027 | 0.621 |
| 9.0315 | 0.621 |
| 9.036 | 0.617 |
| 9.0405 | 0.612 |
| 9.045 | 0.612 |
| 9.0495 | 0.608 |
| 9.054 | 0.608 |
| 9.0585 | 0.603 |
| 9.063 | 0.603 |
| 9.0675 | 0.599 |
| 9.072 | 0.595 |
| 9.0765 | 0.595 |
| 9.081 | 0.59 |
| 9.0855 | 0.59 |
| 9.09 | 0.585 |
| 9.0945 | 0.585 |
| 9.099 | 0.58 |
| 9.1035 | 0.58 |
| 9.108 | 0.574 |
| 9.1125 | 0.569 |
| 9.117 | 0.569 |
| 9.1215 | 0.563 |
| 9.126 | 0.563 |
| 9.1305 | 0.557 |
| 9.135 | 0.557 |
| 9.1395 | 0.551 |
| 9.144 | 0.551 |
| 9.1485 | 0.546 |
| 9.153 | 0.541 |
| 9.1575 | 0.541 |
| 9.162 | 0.537 |
| 9.1665 | 0.537 |
| 9.171 | 0.533 |
| 9.1755 | 0.533 |
| 9.18 | 0.531 |
| 9.1845 | 0.531 |
| 9.189 | 0.53 |
| 9.1935 | 0.528 |
| 9.198 | 0.528 |
| 9.2025 | 0.526 |
| 9.207 | 0.526 |
| 9.2115 | 0.523 |
| 9.216 | 0.523 |
| 9.2205 | 0.518 |
| 9.225 | 0.512 |
| 9.2295 | 0.512 |
| 9.234 | 0.505 |
| 9.2385 | 0.505 |
| 9.243 | 0.497 |
| 9.2475 | 0.497 |
| 9.252 | 0.49 |
| 9.2565 | 0.49 |
| 9.261 | 0.484 |
| 9.2655 | 0.48 |
| 9.27 | 0.48 |
| 9.2745 | 0.476 |
| 9.279 | 0.476 |
| 9.2835 | 0.472 |
| 9.288 | 0.472 |
| 9.2925 | 0.469 |
| 9.297 | 0.469 |
| 9.3015 | 0.466 |
| 9.306 | 0.463 |
| 9.3105 | 0.463 |
| 9.315 | 0.46 |
| 9.3195 | 0.46 |
| 9.324 | 0.456 |
| 9.3285 | 0.456 |
| 9.333 | 0.453 |
| 9.3375 | 0.453 |
| 9.342 | 0.449 |
| 9.3465 | 0.444 |
| 9.351 | 0.444 |
| 9.3555 | 0.44 |
| 9.36 | 0.44 |
| 9.3645 | 0.435 |
| 9.369 | 0.435 |
| 9.3735 | 0.431 |
| 9.378 | 0.427 |
| 9.3825 | 0.427 |
| 9.387 | 0.423 |
| 9.3915 | 0.423 |
| 9.396 | 0.417 |
| 9.4005 | 0.417 |
| 9.405 | 0.411 |
| 9.4095 | 0.411 |
| 9.414 | 0.405 |
| 9.4185 | 0.399 |
| 9.423 | 0.399 |
| 9.4275 | 0.395 |
| 9.432 | 0.395 |
| 9.4365 | 0.392 |
| 9.441 | 0.392 |
| 9.4455 | 0.391 |
| 9.45 | 0.391 |
| 9.4545 | 0.391 |
| 9.459 | 0.391 |
| 9.4635 | 0.391 |
| 9.468 | 0.389 |
| 9.4725 | 0.389 |
| 9.477 | 0.387 |
| 9.4815 | 0.387 |
| 9.486 | 0.383 |
| 9.4905 | 0.383 |
| 9.495 | 0.379 |
| 9.4995 | 0.374 |
| 9.504 | 0.374 |
| 9.5085 | 0.37 |
| 9.513 | 0.37 |
| 9.5175 | 0.366 |
| 9.522 | 0.366 |
| 9.5265 | 0.361 |
| 9.531 | 0.357 |
| 9.5355 | 0.357 |
| 9.54 | 0.352 |
| 9.5445 | 0.352 |
| 9.549 | 0.347 |
| 9.5535 | 0.347 |
| 9.558 | 0.342 |
| 9.5625 | 0.342 |
| 9.567 | 0.337 |
| 9.5715 | 0.332 |
| 9.576 | 0.332 |
| 9.5805 | 0.328 |
| 9.585 | 0.328 |
| 9.5895 | 0.324 |
| 9.594 | 0.324 |
| 9.5985 | 0.321 |
| 9.603 | 0.321 |
| 9.6075 | 0.318 |
| 9.612 | 0.317 |
| 9.6165 | 0.317 |
| 9.621 | 0.315 |
| 9.6255 | 0.315 |
| 9.63 | 0.314 |
| 9.6345 | 0.314 |
| 9.639 | 0.313 |
| 9.6435 | 0.312 |
| 9.648 | 0.311 |
| 9.6525 | 0.308 |
| 9.657 | 0.308 |
| 9.6615 | 0.304 |
| 9.666 | 0.304 |
| 9.6705 | 0.3 |
| 9.675 | 0.3 |
| 9.6795 | 0.297 |
| 9.684 | 0.294 |
| 9.6885 | 0.294 |
| 9.693 | 0.293 |
| 9.6975 | 0.293 |
| 9.702 | 0.292 |
| 9.7065 | 0.292 |
| 9.711 | 0.292 |
| 9.7155 | 0.292 |
| 9.72 | 0.291 |
| 9.7245 | 0.288 |
| 9.729 | 0.288 |
| 9.7335 | 0.284 |
| 9.738 | 0.284 |
| 9.7425 | 0.28 |
| 9.747 | 0.28 |
| 9.7515 | 0.274 |
| 9.756 | 0.274 |
| 9.7605 | 0.268 |
| 9.765 | 0.263 |
| 9.7695 | 0.263 |
| 9.774 | 0.258 |
| 9.7785 | 0.258 |
| 9.783 | 0.254 |
| 9.7875 | 0.254 |
| 9.792 | 0.251 |
| 9.7965 | 0.248 |
| 9.801 | 0.248 |
| 9.8055 | 0.247 |
| 9.81 | 0.247 |
| 9.8145 | 0.246 |
| 9.819 | 0.246 |
| 9.8235 | 0.245 |
| 9.828 | 0.245 |
| 9.8325 | 0.243 |
| 9.837 | 0.242 |
| 9.8415 | 0.242 |
| 9.846 | 0.24 |
| 9.8505 | 0.24 |
| 9.855 | 0.238 |
| 9.8595 | 0.238 |
| 9.864 | 0.236 |
| 9.8685 | 0.236 |
| 9.873 | 0.234 |
| 9.8775 | 0.232 |
| 9.882 | 0.232 |
| 9.8865 | 0.232 |
| 9.891 | 0.232 |
| 9.8955 | 0.232 |
| 9.9 | 0.232 |
| 9.9045 | 0.232 |
| 9.909 | 0.232 |
| 9.9135 | 0.232 |
| 9.918 | 0.231 |
| 9.9225 | 0.231 |
| 9.927 | 0.23 |
| 9.9315 | 0.23 |
| 9.936 | 0.227 |
| 9.9405 | 0.227 |
| 9.945 | 0.224 |
| 9.9495 | 0.22 |
| 9.954 | 0.22 |
| 9.9585 | 0.217 |
| 9.963 | 0.217 |
| 9.9675 | 0.213 |
| 9.972 | 0.213 |
| 9.9765 | 0.21 |
| 9.981 | 0.21 |
| 9.9855 | 0.208 |
| 9.99 | 0.206 |
| 9.9945 | 0.206 |
| 9.999 | 0.206 |
| 10.0035 | 0.206 |
| 10.008 | 0.206 |
| 10.0125 | 0.206 |
| 10.017 | 0.207 |
| 10.0215 | 0.207 |
| 10.026 | 0.209 |
| 10.0305 | 0.21 |
| 10.035 | 0.21 |
| 10.0395 | 0.21 |
| 10.044 | 0.21 |
| 10.0485 | 0.211 |
| 10.053 | 0.211 |
| 10.0575 | 0.211 |
| 10.062 | 0.211 |
| 10.0665 | 0.21 |
| 10.071 | 0.209 |
| 10.0755 | 0.209 |
| 10.08 | 0.207 |
| 10.0845 | 0.207 |
| 10.089 | 0.204 |
| 10.0935 | 0.204 |
| 10.098 | 0.2 |
| 10.1025 | 0.196 |
| 10.107 | 0.196 |
| 10.1115 | 0.191 |
| 10.116 | 0.191 |
| 10.1205 | 0.187 |
| 10.125 | 0.187 |
| 10.1295 | 0.183 |
| 10.134 | 0.183 |
| 10.1385 | 0.18 |
| 10.143 | 0.178 |
| 10.1475 | 0.178 |
| 10.152 | 0.177 |
| 10.1565 | 0.177 |
| 10.161 | 0.177 |
| 10.1655 | 0.177 |
| 10.17 | 0.177 |
| 10.1745 | 0.177 |
| 10.179 | 0.178 |
| 10.1835 | 0.178 |
| 10.188 | 0.178 |
| 10.1925 | 0.177 |
| 10.197 | 0.177 |
| 10.2015 | 0.176 |
| 10.206 | 0.176 |
| 10.2105 | 0.174 |
| 10.215 | 0.173 |
| 10.2195 | 0.173 |
| 10.224 | 0.171 |
| 10.2285 | 0.171 |
| 10.233 | 0.17 |
| 10.2375 | 0.17 |
| 10.242 | 0.17 |
| 10.2465 | 0.17 |
| 10.251 | 0.17 |
| 10.2555 | 0.171 |
| 10.26 | 0.171 |
| 10.2645 | 0.173 |
| 10.269 | 0.173 |
| 10.2735 | 0.175 |
| 10.278 | 0.175 |
| 10.2825 | 0.178 |
| 10.287 | 0.178 |
| 10.2915 | 0.181 |
| 10.296 | 0.184 |
| 10.3005 | 0.184 |
| 10.305 | 0.187 |
| 10.3095 | 0.187 |
| 10.314 | 0.189 |
| 10.3185 | 0.189 |
| 10.323 | 0.189 |
| 10.3275 | 0.189 |
| 10.332 | 0.189 |
| 10.3365 | 0.186 |
| 10.341 | 0.186 |
| 10.3455 | 0.183 |
| 10.35 | 0.183 |
| 10.3545 | 0.181 |
| 10.359 | 0.181 |
| 10.3635 | 0.178 |
| 10.368 | 0.177 |
| 10.3725 | 0.176 |
| 10.377 | 0.176 |
| 10.3815 | 0.176 |
| 10.386 | 0.176 |
| 10.3905 | 0.176 |
| 10.395 | 0.176 |
| 10.3995 | 0.176 |
| 10.404 | 0.177 |
| 10.4085 | 0.178 |
| 10.413 | 0.178 |
| 10.4175 | 0.179 |
| 10.422 | 0.179 |
| 10.4265 | 0.179 |
| 10.431 | 0.179 |
| 10.4355 | 0.179 |
| 10.44 | 0.179 |
| 10.4445 | 0.18 |
| 10.449 | 0.181 |
| 10.4535 | 0.181 |
| 10.458 | 0.182 |
| 10.4625 | 0.182 |
| 10.467 | 0.184 |
| 10.4715 | 0.184 |
| 10.476 | 0.186 |
| 10.4805 | 0.186 |
| 10.485 | 0.188 |
| 10.4895 | 0.189 |
| 10.494 | 0.189 |
| 10.4985 | 0.189 |
| 10.503 | 0.189 |
| 10.5075 | 0.189 |
| 10.512 | 0.189 |
| 10.5165 | 0.188 |
| 10.521 | 0.187 |
| 10.5255 | 0.187 |
| 10.53 | 0.186 |
| 10.5345 | 0.186 |
| 10.539 | 0.186 |
| 10.5435 | 0.186 |
| 10.548 | 0.186 |
| 10.5525 | 0.186 |
| 10.557 | 0.186 |
| 10.5615 | 0.187 |
| 10.566 | 0.187 |
| 10.5705 | 0.188 |
| 10.575 | 0.188 |
| 10.5795 | 0.188 |
| 10.584 | 0.188 |
| 10.5885 | 0.19 |
| 10.593 | 0.19 |
| 10.5975 | 0.192 |
| 10.602 | 0.194 |
| 10.6065 | 0.194 |
| 10.611 | 0.197 |
| 10.6155 | 0.197 |
| 10.62 | 0.201 |
| 10.6245 | 0.201 |
| 10.629 | 0.205 |
| 10.6335 | 0.205 |
| 10.638 | 0.209 |
| 10.6425 | 0.213 |
| 10.647 | 0.213 |
| 10.6515 | 0.217 |
| 10.656 | 0.217 |
| 10.6605 | 0.221 |
| 10.665 | 0.221 |
| 10.6695 | 0.224 |
| 10.674 | 0.228 |
| 10.6785 | 0.228 |
| 10.683 | 0.231 |
| 10.6875 | 0.231 |
| 10.692 | 0.234 |
| 10.6965 | 0.234 |
| 10.701 | 0.236 |
| 10.7055 | 0.236 |
| 10.71 | 0.238 |
| 10.7145 | 0.239 |
| 10.719 | 0.239 |
| 10.7235 | 0.239 |
| 10.728 | 0.239 |
| 10.7325 | 0.239 |
| 10.737 | 0.239 |
| 10.7415 | 0.239 |
| 10.746 | 0.239 |
| 10.7505 | 0.239 |
| 10.755 | 0.24 |
| 10.7595 | 0.24 |
| 10.764 | 0.242 |
| 10.7685 | 0.242 |
| 10.773 | 0.245 |
| 10.7775 | 0.245 |
| 10.782 | 0.25 |
| 10.7865 | 0.25 |
| 10.791 | 0.255 |
| 10.7955 | 0.26 |
| 10.8 | 0.26 |
| 10.8045 | 0.265 |
| 10.809 | 0.265 |
| 10.8135 | 0.269 |
| 10.818 | 0.269 |
| 10.8225 | 0.273 |
| 10.827 | 0.276 |
| 10.8315 | 0.276 |
| 10.836 | 0.279 |
| 10.8405 | 0.279 |
| 10.845 | 0.281 |
| 10.8495 | 0.281 |
| 10.854 | 0.283 |
| 10.8585 | 0.283 |
| 10.863 | 0.286 |
| 10.8675 | 0.288 |
| 10.872 | 0.288 |
| 10.8765 | 0.291 |
| 10.881 | 0.291 |
| 10.8855 | 0.293 |
| 10.89 | 0.293 |
| 10.8945 | 0.296 |
| 10.899 | 0.296 |
| 10.9035 | 0.299 |
| 10.908 | 0.302 |
| 10.9125 | 0.302 |
| 10.917 | 0.305 |
| 10.9215 | 0.305 |
| 10.926 | 0.308 |
| 10.9305 | 0.308 |
| 10.935 | 0.311 |
| 10.9395 | 0.313 |
| 10.944 | 0.315 |
| 10.9485 | 0.318 |
| 10.953 | 0.318 |
| 10.9575 | 0.321 |
| 10.962 | 0.321 |
| 10.9665 | 0.324 |
| 10.971 | 0.324 |
| 10.9755 | 0.328 |
| 10.98 | 0.331 |
| 10.9845 | 0.331 |
| 10.989 | 0.334 |
| 10.9935 | 0.334 |
| 10.998 | 0.339 |
| 11.0025 | 0.339 |
| 11.007 | 0.343 |
| 11.0115 | 0.343 |
| 11.016 | 0.349 |
| 11.0205 | 0.355 |
| 11.025 | 0.355 |
| 11.0295 | 0.362 |
| 11.034 | 0.362 |
| 11.0385 | 0.369 |
| 11.043 | 0.369 |
| 11.0475 | 0.376 |
| 11.052 | 0.376 |
| 11.0565 | 0.383 |
| 11.061 | 0.389 |
| 11.0655 | 0.389 |
| 11.07 | 0.395 |
| 11.0745 | 0.395 |
| 11.079 | 0.4 |
| 11.0835 | 0.4 |
| 11.088 | 0.404 |
| 11.0925 | 0.408 |
| 11.097 | 0.408 |
| 11.1015 | 0.411 |
| 11.106 | 0.411 |
| 11.1105 | 0.413 |
| 11.115 | 0.413 |
| 11.1195 | 0.414 |
| 11.124 | 0.414 |
| 11.1285 | 0.416 |
| 11.133 | 0.417 |
| 11.1375 | 0.417 |
| 11.142 | 0.418 |
| 11.1465 | 0.418 |
| 11.151 | 0.42 |
| 11.1555 | 0.42 |
| 11.16 | 0.423 |
| 11.1645 | 0.423 |
| 11.169 | 0.427 |
| 11.1735 | 0.432 |
| 11.178 | 0.432 |
| 11.1825 | 0.438 |
| 11.187 | 0.438 |
| 11.1915 | 0.445 |
| 11.196 | 0.445 |
| 11.2005 | 0.452 |
| 11.205 | 0.452 |
| 11.2095 | 0.46 |
| 11.214 | 0.468 |
| 11.2185 | 0.468 |
| 11.223 | 0.475 |
| 11.2275 | 0.475 |
| 11.232 | 0.481 |
| 11.2365 | 0.481 |
| 11.241 | 0.487 |
| 11.2455 | 0.492 |
| 11.25 | 0.492 |
| 11.2545 | 0.496 |
| 11.259 | 0.496 |
| 11.2635 | 0.5 |
| 11.268 | 0.5 |
| 11.2725 | 0.504 |
| 11.277 | 0.504 |
| 11.2815 | 0.507 |
| 11.286 | 0.511 |
| 11.2905 | 0.511 |
| 11.295 | 0.515 |
| 11.2995 | 0.515 |
| 11.304 | 0.519 |
| 11.3085 | 0.519 |
| 11.313 | 0.523 |
| 11.3175 | 0.523 |
| 11.322 | 0.527 |
| 11.3265 | 0.531 |
| 11.331 | 0.531 |
| 11.3355 | 0.535 |
| 11.34 | 0.535 |
| 11.3445 | 0.539 |
| 11.349 | 0.539 |
| 11.3535 | 0.543 |
| 11.358 | 0.543 |
| 11.3625 | 0.547 |
| 11.367 | 0.551 |
| 11.3715 | 0.551 |
| 11.376 | 0.557 |
| 11.3805 | 0.557 |
| 11.385 | 0.564 |
| 11.3895 | 0.564 |
| 11.394 | 0.571 |
| 11.3985 | 0.579 |
| 11.403 | 0.579 |
| 11.4075 | 0.589 |
| 11.412 | 0.589 |
| 11.4165 | 0.598 |
| 11.421 | 0.598 |
| 11.4255 | 0.607 |
| 11.43 | 0.607 |
| 11.4345 | 0.616 |
| 11.439 | 0.625 |
| 11.4435 | 0.625 |
| 11.448 | 0.633 |
| 11.4525 | 0.633 |
| 11.457 | 0.641 |
| 11.4615 | 0.641 |
| 11.466 | 0.649 |
| 11.4705 | 0.649 |
| 11.475 | 0.656 |
| 11.4795 | 0.664 |
| 11.484 | 0.664 |
| 11.4885 | 0.671 |
| 11.493 | 0.671 |
| 11.4975 | 0.679 |
| 11.502 | 0.679 |
| 11.5065 | 0.688 |
| 11.511 | 0.693 |
| 11.5155 | 0.697 |
| 11.52 | 0.706 |
| 11.5245 | 0.706 |
| 11.529 | 0.715 |
| 11.5335 | 0.715 |
| 11.538 | 0.724 |
| 11.5425 | 0.724 |
| 11.547 | 0.733 |
| 11.5515 | 0.741 |
| 11.556 | 0.741 |
| 11.5605 | 0.748 |
| 11.565 | 0.748 |
| 11.5695 | 0.755 |
| 11.574 | 0.755 |
| 11.5785 | 0.761 |
| 11.583 | 0.761 |
| 11.5875 | 0.765 |
| 11.592 | 0.769 |
| 11.5965 | 0.769 |
| 11.601 | 0.773 |
| 11.6055 | 0.773 |
| 11.61 | 0.777 |
| 11.6145 | 0.777 |
| 11.619 | 0.781 |
| 11.6235 | 0.781 |
| 11.628 | 0.786 |
| 11.6325 | 0.792 |
| 11.637 | 0.792 |
| 11.6415 | 0.799 |
| 11.646 | 0.799 |
| 11.6505 | 0.807 |
| 11.655 | 0.807 |
| 11.6595 | 0.816 |
| 11.664 | 0.82 |
| 11.6685 | 0.825 |
| 11.673 | 0.834 |
| 11.6775 | 0.834 |
| 11.682 | 0.844 |
| 11.6865 | 0.844 |
| 11.691 | 0.853 |
| 11.6955 | 0.853 |
| 11.7 | 0.862 |
| 11.7045 | 0.871 |
| 11.709 | 0.871 |
| 11.7135 | 0.88 |
| 11.718 | 0.88 |
| 11.7225 | 0.889 |
| 11.727 | 0.889 |
| 11.7315 | 0.898 |
| 11.736 | 0.898 |
| 11.7405 | 0.908 |
| 11.745 | 0.919 |
| 11.7495 | 0.919 |
| 11.754 | 0.93 |
| 11.7585 | 0.93 |
| 11.763 | 0.941 |
| 11.7675 | 0.941 |
| 11.772 | 0.952 |
| 11.7765 | 0.952 |
| 11.781 | 0.963 |
| 11.7855 | 0.974 |
| 11.79 | 0.974 |
| 11.7945 | 0.984 |
| 11.799 | 0.984 |
| 11.8035 | 0.994 |
| 11.808 | 0.994 |
| 11.8125 | 1.003 |
| 11.817 | 1.011 |
| 11.8215 | 1.011 |
| 11.826 | 1.02 |
| 11.8305 | 1.02 |
| 11.835 | 1.028 |
| 11.8395 | 1.028 |
| 11.844 | 1.036 |
| 11.8485 | 1.036 |
| 11.853 | 1.043 |
| 11.8575 | 1.051 |
| 11.862 | 1.051 |
| 11.8665 | 1.059 |
| 11.871 | 1.059 |
| 11.8755 | 1.066 |
| 11.88 | 1.066 |
| 11.8845 | 1.074 |
| 11.889 | 1.074 |
| 11.8935 | 1.081 |
| 11.898 | 1.089 |
| 11.9025 | 1.089 |
| 11.907 | 1.097 |
| 11.9115 | 1.097 |
| 11.916 | 1.105 |
| 11.9205 | 1.105 |
| 11.925 | 1.114 |
| 11.9295 | 1.114 |
| 11.934 | 1.124 |
| 11.9385 | 1.133 |
| 11.943 | 1.133 |
| 11.9475 | 1.143 |
| 11.952 | 1.143 |
| 11.9565 | 1.153 |
| 11.961 | 1.153 |
| 11.9655 | 1.164 |
| 11.97 | 1.174 |
| 11.9745 | 1.174 |
| 11.979 | 1.184 |
| 11.9835 | 1.184 |
| 11.988 | 1.193 |
| 11.9925 | 1.193 |
| 11.997 | 1.203 |
| 12.0015 | 1.203 |
| 12.006 | 1.212 |
| 12.0105 | 1.221 |
| 12.015 | 1.221 |
| 12.0195 | 1.23 |
| 12.024 | 1.23 |
| 12.0285 | 1.239 |
| 12.033 | 1.239 |
| 12.0375 | 1.248 |
| 12.042 | 1.248 |
| 12.0465 | 1.257 |
| 12.051 | 1.266 |
| 12.0555 | 1.266 |
| 12.06 | 1.275 |
| 12.0645 | 1.275 |
| 12.069 | 1.283 |
| 12.0735 | 1.283 |
| 12.078 | 1.292 |
| 12.0825 | 1.296 |
| 12.087 | 1.301 |
| 12.0915 | 1.309 |
| 12.096 | 1.309 |
| 12.1005 | 1.317 |
| 12.105 | 1.317 |
| 12.1095 | 1.326 |
| 12.114 | 1.326 |
| 12.1185 | 1.334 |
| 12.123 | 1.343 |
| 12.1275 | 1.343 |
| 12.132 | 1.351 |
| 12.1365 | 1.351 |
| 12.141 | 1.36 |
| 12.1455 | 1.36 |
| 12.15 | 1.369 |
| 12.1545 | 1.369 |
| 12.159 | 1.378 |
| 12.1635 | 1.388 |
| 12.168 | 1.388 |
| 12.1725 | 1.398 |
| 12.177 | 1.398 |
| 12.1815 | 1.408 |
| 12.186 | 1.408 |
| 12.1905 | 1.418 |
| 12.195 | 1.418 |
| 12.1995 | 1.429 |
| 12.204 | 1.44 |
| 12.2085 | 1.44 |
| 12.213 | 1.451 |
| 12.2175 | 1.451 |
| 12.222 | 1.463 |
| 12.2265 | 1.463 |
| 12.231 | 1.475 |
| 12.2355 | 1.481 |
| 12.24 | 1.487 |
| 12.2445 | 1.5 |
| 12.249 | 1.5 |
| 12.2535 | 1.512 |
| 12.258 | 1.512 |
| 12.2625 | 1.524 |
| 12.267 | 1.524 |
| 12.2715 | 1.536 |
| 12.276 | 1.548 |
| 12.2805 | 1.548 |
| 12.285 | 1.56 |
| 12.2895 | 1.56 |
| 12.294 | 1.572 |
| 12.2985 | 1.572 |
| 12.303 | 1.584 |
| 12.3075 | 1.584 |
| 12.312 | 1.595 |
| 12.3165 | 1.607 |
| 12.321 | 1.607 |
| 12.3255 | 1.619 |
| 12.33 | 1.619 |
| 12.3345 | 1.632 |
| 12.339 | 1.632 |
| 12.3435 | 1.644 |
| 12.348 | 1.644 |
| 12.3525 | 1.657 |
| 12.357 | 1.671 |
| 12.3615 | 1.671 |
| 12.366 | 1.685 |
| 12.3705 | 1.685 |
| 12.375 | 1.698 |
| 12.3795 | 1.698 |
| 12.384 | 1.711 |
| 12.3885 | 1.725 |
| 12.393 | 1.725 |
| 12.3975 | 1.738 |
| 12.402 | 1.738 |
| 12.4065 | 1.751 |
| 12.411 | 1.751 |
| 12.4155 | 1.763 |
| 12.42 | 1.763 |
| 12.4245 | 1.775 |
| 12.429 | 1.787 |
| 12.4335 | 1.787 |
| 12.438 | 1.798 |
| 12.4425 | 1.798 |
| 12.447 | 1.808 |
| 12.4515 | 1.808 |
| 12.456 | 1.819 |
| 12.4605 | 1.819 |
| 12.465 | 1.829 |
| 12.4695 | 1.839 |
| 12.474 | 1.839 |
| 12.4785 | 1.849 |
| 12.483 | 1.849 |
| 12.4875 | 1.858 |
| 12.492 | 1.858 |
| 12.4965 | 1.868 |
| 12.501 | 1.868 |
| 12.5055 | 1.878 |
| 12.51 | 1.887 |
| 12.5145 | 1.887 |
| 12.519 | 1.897 |
| 12.5235 | 1.897 |
| 12.528 | 1.908 |
| 12.5325 | 1.908 |
| 12.537 | 1.919 |
| 12.5415 | 1.93 |
| 12.546 | 1.93 |
| 12.5505 | 1.942 |
| 12.555 | 1.942 |
| 12.5595 | 1.955 |
| 12.564 | 1.955 |
| 12.5685 | 1.97 |
| 12.573 | 1.97 |
| 12.5775 | 1.984 |
| 12.582 | 1.999 |
| 12.5865 | 1.999 |
| 12.591 | 2.014 |
| 12.5955 | 2.014 |
| 12.6 | 2.029 |
| 12.6045 | 2.029 |
| 12.609 | 2.045 |
| 12.6135 | 2.045 |
| 12.618 | 2.06 |
| 12.6225 | 2.074 |
| 12.627 | 2.074 |
| 12.6315 | 2.089 |
| 12.636 | 2.089 |
| 12.6405 | 2.103 |
| 12.645 | 2.103 |
| 12.6495 | 2.117 |
| 12.654 | 2.117 |
| 12.6585 | 2.131 |
| 12.663 | 2.145 |
| 12.6675 | 2.145 |
| 12.672 | 2.159 |
| 12.6765 | 2.159 |
| 12.681 | 2.174 |
| 12.6855 | 2.174 |
| 12.69 | 2.188 |
| 12.6945 | 2.203 |
| 12.699 | 2.203 |
| 12.7035 | 2.218 |
| 12.708 | 2.218 |
| 12.7125 | 2.231 |
| 12.717 | 2.231 |
| 12.7215 | 2.244 |
| 12.726 | 2.244 |
| 12.7305 | 2.257 |
| 12.735 | 2.27 |
| 12.7395 | 2.27 |
| 12.744 | 2.282 |
| 12.7485 | 2.282 |
| 12.753 | 2.292 |
| 12.7575 | 2.292 |
| 12.762 | 2.303 |
| 12.7665 | 2.303 |
| 12.771 | 2.314 |
| 12.7755 | 2.325 |
| 12.78 | 2.325 |
| 12.7845 | 2.336 |
| 12.789 | 2.336 |
| 12.7935 | 2.347 |
| 12.798 | 2.347 |
| 12.8025 | 2.359 |
| 12.807 | 2.365 |
| 12.8115 | 2.372 |
| 12.816 | 2.385 |
| 12.8205 | 2.385 |
| 12.825 | 2.399 |
| 12.8295 | 2.399 |
| 12.834 | 2.413 |
| 12.8385 | 2.413 |
| 12.843 | 2.427 |
| 12.8475 | 2.442 |
| 12.852 | 2.442 |
| 12.8565 | 2.456 |
| 12.861 | 2.456 |
| 12.8655 | 2.471 |
| 12.87 | 2.471 |
| 12.8745 | 2.485 |
| 12.879 | 2.485 |
| 12.8835 | 2.5 |
| 12.888 | 2.514 |
| 12.8925 | 2.514 |
| 12.897 | 2.529 |
| 12.9015 | 2.529 |
| 12.906 | 2.543 |
| 12.9105 | 2.543 |
| 12.915 | 2.558 |
| 12.9195 | 2.558 |
| 12.924 | 2.572 |
| 12.9285 | 2.587 |
| 12.933 | 2.587 |
| 12.9375 | 2.602 |
| 12.942 | 2.602 |
| 12.9465 | 2.617 |
| 12.951 | 2.617 |
| 12.9555 | 2.632 |
| 12.96 | 2.64 |
| 12.9645 | 2.647 |
| 12.969 | 2.662 |
| 12.9735 | 2.662 |
| 12.978 | 2.677 |
| 12.9825 | 2.677 |
| 12.987 | 2.692 |
| 12.9915 | 2.692 |
| 12.996 | 2.707 |
| 13.0005 | 2.723 |
| 13.005 | 2.723 |
| 13.0095 | 2.739 |
| 13.014 | 2.739 |
| 13.0185 | 2.754 |
| 13.023 | 2.754 |
| 13.0275 | 2.77 |
| 13.032 | 2.77 |
| 13.0365 | 2.787 |
| 13.041 | 2.803 |
| 13.0455 | 2.803 |
| 13.05 | 2.82 |
| 13.0545 | 2.82 |
| 13.059 | 2.836 |
| 13.0635 | 2.836 |
| 13.068 | 2.852 |
| 13.0725 | 2.852 |
| 13.077 | 2.869 |
| 13.0815 | 2.885 |
| 13.086 | 2.885 |
| 13.0905 | 2.902 |
| 13.095 | 2.902 |
| 13.0995 | 2.918 |
| 13.104 | 2.918 |
| 13.1085 | 2.935 |
| 13.113 | 2.952 |
| 13.1175 | 2.952 |
| 13.122 | 2.969 |
| 13.1265 | 2.969 |
| 13.131 | 2.986 |
| 13.1355 | 2.986 |
| 13.14 | 3.003 |
| 13.1445 | 3.003 |
| 13.149 | 3.02 |
| 13.1535 | 3.037 |
| 13.158 | 3.037 |
| 13.1625 | 3.053 |
| 13.167 | 3.053 |
| 13.1715 | 3.067 |
| 13.176 | 3.067 |
| 13.1805 | 3.08 |
| 13.185 | 3.08 |
| 13.1895 | 3.094 |
| 13.194 | 3.107 |
| 13.1985 | 3.107 |
| 13.203 | 3.118 |
| 13.2075 | 3.118 |
| 13.212 | 3.128 |
| 13.2165 | 3.128 |
| 13.221 | 3.139 |
| 13.2255 | 3.139 |
| 13.23 | 3.15 |
| 13.2345 | 3.162 |
| 13.239 | 3.162 |
| 13.2435 | 3.173 |
| 13.248 | 3.173 |
| 13.2525 | 3.185 |
| 13.257 | 3.185 |
| 13.2615 | 3.198 |
| 13.266 | 3.212 |
| 13.2705 | 3.212 |
| 13.275 | 3.226 |
| 13.2795 | 3.226 |
| 13.284 | 3.241 |
| 13.2885 | 3.241 |
| 13.293 | 3.256 |
| 13.2975 | 3.256 |
| 13.302 | 3.272 |
| 13.3065 | 3.288 |
| 13.311 | 3.288 |
| 13.3155 | 3.305 |
| 13.32 | 3.305 |
| 13.3245 | 3.322 |
| 13.329 | 3.322 |
| 13.3335 | 3.338 |
| 13.338 | 3.338 |
| 13.3425 | 3.355 |
| 13.347 | 3.372 |
| 13.3515 | 3.372 |
| 13.356 | 3.389 |
| 13.3605 | 3.389 |
| 13.365 | 3.406 |
| 13.3695 | 3.406 |
| 13.374 | 3.423 |
| 13.3785 | 3.431 |
| 13.383 | 3.439 |
| 13.3875 | 3.455 |
| 13.392 | 3.455 |
| 13.3965 | 3.471 |
| 13.401 | 3.471 |
| 13.4055 | 3.487 |
| 13.41 | 3.487 |
| 13.4145 | 3.503 |
| 13.419 | 3.518 |
| 13.4235 | 3.518 |
| 13.428 | 3.533 |
| 13.4325 | 3.533 |
| 13.437 | 3.548 |
| 13.4415 | 3.548 |
| 13.446 | 3.563 |
| 13.4505 | 3.563 |
| 13.455 | 3.578 |
| 13.4595 | 3.593 |
| 13.464 | 3.593 |
| 13.4685 | 3.608 |
| 13.473 | 3.608 |
| 13.4775 | 3.623 |
| 13.482 | 3.623 |
| 13.4865 | 3.638 |
| 13.491 | 3.638 |
| 13.4955 | 3.653 |
| 13.5 | 3.669 |
| 13.5045 | 3.669 |
| 13.509 | 3.684 |
| 13.5135 | 3.684 |
| 13.518 | 3.7 |
| 13.5225 | 3.7 |
| 13.527 | 3.716 |
| 13.5315 | 3.724 |
| 13.536 | 3.732 |
| 13.5405 | 3.749 |
| 13.545 | 3.749 |
| 13.5495 | 3.767 |
| 13.554 | 3.767 |
| 13.5585 | 3.785 |
| 13.563 | 3.785 |
| 13.5675 | 3.803 |
| 13.572 | 3.821 |
| 13.5765 | 3.821 |
| 13.581 | 3.84 |
| 13.5855 | 3.84 |
| 13.59 | 3.859 |
| 13.5945 | 3.859 |
| 13.599 | 3.879 |
| 13.6035 | 3.879 |
| 13.608 | 3.898 |
| 13.6125 | 3.918 |
| 13.617 | 3.918 |
| 13.6215 | 3.938 |
| 13.626 | 3.938 |
| 13.6305 | 3.957 |
| 13.635 | 3.957 |
| 13.6395 | 3.977 |
| 13.644 | 3.977 |
| 13.6485 | 3.996 |
| 13.653 | 4.015 |
| 13.6575 | 4.015 |
| 13.662 | 4.034 |
| 13.6665 | 4.034 |
| 13.671 | 4.052 |
| 13.6755 | 4.052 |
| 13.68 | 4.071 |
| 13.6845 | 4.089 |
| 13.689 | 4.089 |
| 13.6935 | 4.106 |
| 13.698 | 4.106 |
| 13.7025 | 4.124 |
| 13.707 | 4.124 |
| 13.7115 | 4.141 |
| 13.716 | 4.141 |
| 13.7205 | 4.159 |
| 13.725 | 4.175 |
| 13.7295 | 4.175 |
| 13.734 | 4.192 |
| 13.7385 | 4.192 |
| 13.743 | 4.209 |
| 13.7475 | 4.209 |
| 13.752 | 4.226 |
| 13.7565 | 4.226 |
| 13.761 | 4.243 |
| 13.7655 | 4.259 |
| 13.77 | 4.259 |
| 13.7745 | 4.276 |
| 13.779 | 4.276 |
| 13.7835 | 4.293 |
| 13.788 | 4.293 |
| 13.7925 | 4.31 |
| 13.797 | 4.31 |
| 13.8015 | 4.327 |
| 13.806 | 4.344 |
| 13.8105 | 4.344 |
| 13.815 | 4.361 |
| 13.8195 | 4.361 |
| 13.824 | 4.378 |
| 13.8285 | 4.378 |
| 13.833 | 4.396 |
| 13.8375 | 4.413 |
| 13.842 | 4.413 |
| 13.8465 | 4.431 |
| 13.851 | 4.431 |
| 13.8555 | 4.449 |
| 13.86 | 4.449 |
| 13.8645 | 4.466 |
| 13.869 | 4.466 |
| 13.8735 | 4.485 |
| 13.878 | 4.503 |
| 13.8825 | 4.503 |
| 13.887 | 4.521 |
| 13.8915 | 4.521 |
| 13.896 | 4.54 |
| 13.9005 | 4.54 |
| 13.905 | 4.558 |
| 13.9095 | 4.558 |
| 13.914 | 4.576 |
| 13.9185 | 4.595 |
| 13.923 | 4.595 |
| 13.9275 | 4.613 |
| 13.932 | 4.613 |
| 13.9365 | 4.632 |
| 13.941 | 4.632 |
| 13.9455 | 4.65 |
| 13.95 | 4.65 |
| 13.9545 | 4.668 |
| 13.959 | 4.686 |
| 13.9635 | 4.686 |
| 13.968 | 4.703 |
| 13.9725 | 4.703 |
| 13.977 | 4.721 |
| 13.9815 | 4.721 |
| 13.986 | 4.739 |
| 13.9905 | 4.757 |
| 13.995 | 4.757 |
| 13.9995 | 4.775 |
| 14.004 | 4.775 |
| 14.0085 | 4.792 |
| 14.013 | 4.792 |
| 14.0175 | 4.81 |
| 14.022 | 4.81 |
| 14.0265 | 4.829 |
| 14.031 | 4.848 |
| 14.0355 | 4.848 |
| 14.04 | 4.866 |
| 14.0445 | 4.866 |
| 14.049 | 4.885 |
| 14.0535 | 4.885 |
| 14.058 | 4.903 |
| 14.0625 | 4.903 |
| 14.067 | 4.923 |
| 14.0715 | 4.942 |
| 14.076 | 4.942 |
| 14.0805 | 4.961 |
| 14.085 | 4.961 |
| 14.0895 | 4.98 |
| 14.094 | 4.98 |
| 14.0985 | 4.999 |
| 14.103 | 5.008 |
| 14.1075 | 5.018 |
| 14.112 | 5.036 |
| 14.1165 | 5.036 |
| 14.121 | 5.055 |
| 14.1255 | 5.055 |
| 14.13 | 5.074 |
| 14.1345 | 5.074 |
| 14.139 | 5.092 |
| 14.1435 | 5.111 |
| 14.148 | 5.111 |
| 14.1525 | 5.129 |
| 14.157 | 5.129 |
| 14.1615 | 5.148 |
| 14.166 | 5.148 |
| 14.1705 | 5.166 |
| 14.175 | 5.166 |
| 14.1795 | 5.186 |
| 14.184 | 5.205 |
| 14.1885 | 5.205 |
| 14.193 | 5.224 |
| 14.1975 | 5.224 |
| 14.202 | 5.243 |
| 14.2065 | 5.243 |
| 14.211 | 5.263 |
| 14.2155 | 5.263 |
| 14.22 | 5.283 |
| 14.2245 | 5.303 |
| 14.229 | 5.303 |
| 14.2335 | 5.323 |
| 14.238 | 5.323 |
| 14.2425 | 5.343 |
| 14.247 | 5.343 |
| 14.2515 | 5.364 |
| 14.256 | 5.374 |
| 14.2605 | 5.384 |
| 14.265 | 5.405 |
| 14.2695 | 5.405 |
| 14.274 | 5.426 |
| 14.2785 | 5.426 |
| 14.283 | 5.446 |
| 14.2875 | 5.446 |
| 14.292 | 5.467 |
| 14.2965 | 5.489 |
| 14.301 | 5.489 |
| 14.3055 | 5.51 |
| 14.31 | 5.51 |
| 14.3145 | 5.531 |
| 14.319 | 5.531 |
| 14.3235 | 5.552 |
| 14.328 | 5.552 |
| 14.3325 | 5.573 |
| 14.337 | 5.595 |
| 14.3415 | 5.595 |
| 14.346 | 5.616 |
| 14.3505 | 5.616 |
| 14.355 | 5.637 |
| 14.3595 | 5.637 |
| 14.364 | 5.657 |
| 14.3685 | 5.657 |
| 14.373 | 5.677 |
| 14.3775 | 5.697 |
| 14.382 | 5.697 |
| 14.3865 | 5.716 |
| 14.391 | 5.716 |
| 14.3955 | 5.735 |
| 14.4 | 5.735 |
| 14.4045 | 5.754 |
| 14.409 | 5.773 |
| 14.4135 | 5.773 |
| 14.418 | 5.791 |
| 14.4225 | 5.791 |
| 14.427 | 5.809 |
| 14.4315 | 5.809 |
| 14.436 | 5.828 |
| 14.4405 | 5.828 |
| 14.445 | 5.846 |
| 14.4495 | 5.865 |
| 14.454 | 5.865 |
| 14.4585 | 5.884 |
| 14.463 | 5.884 |
| 14.4675 | 5.904 |
| 14.472 | 5.904 |
| 14.4765 | 5.923 |
| 14.481 | 5.923 |
| 14.4855 | 5.942 |
| 14.49 | 5.963 |
| 14.4945 | 5.963 |
| 14.499 | 5.983 |
| 14.5035 | 5.983 |
| 14.508 | 6.003 |
| 14.5125 | 6.003 |
| 14.517 | 6.024 |
| 14.5215 | 6.024 |
| 14.526 | 6.044 |
| 14.5305 | 6.065 |
| 14.535 | 6.065 |
| 14.5395 | 6.085 |
| 14.544 | 6.085 |
| 14.5485 | 6.106 |
| 14.553 | 6.106 |
| 14.5575 | 6.126 |
| 14.562 | 6.147 |
| 14.5665 | 6.147 |
| 14.571 | 6.168 |
| 14.5755 | 6.168 |
| 14.58 | 6.189 |
| 14.5845 | 6.189 |
| 14.589 | 6.21 |
| 14.5935 | 6.21 |
| 14.598 | 6.231 |
| 14.6025 | 6.252 |
| 14.607 | 6.252 |
| 14.6115 | 6.274 |
| 14.616 | 6.274 |
| 14.6205 | 6.297 |
| 14.625 | 6.297 |
| 14.6295 | 6.319 |
| 14.634 | 6.319 |
| 14.6385 | 6.342 |
| 14.643 | 6.364 |
| 14.6475 | 6.364 |
| 14.652 | 6.387 |
| 14.6565 | 6.387 |
| 14.661 | 6.41 |
| 14.6655 | 6.41 |
| 14.67 | 6.433 |
| 14.6745 | 6.444 |
| 14.679 | 6.456 |
| 14.6835 | 6.479 |
| 14.688 | 6.479 |
| 14.6925 | 6.501 |
| 14.697 | 6.501 |
| 14.7015 | 6.523 |
| 14.706 | 6.523 |
| 14.7105 | 6.545 |
| 14.715 | 6.567 |
| 14.7195 | 6.567 |
| 14.724 | 6.589 |
| 14.7285 | 6.589 |
| 14.733 | 6.61 |
| 14.7375 | 6.61 |
| 14.742 | 6.632 |
| 14.7465 | 6.632 |
| 14.751 | 6.653 |
| 14.7555 | 6.674 |
| 14.76 | 6.674 |
| 14.7645 | 6.695 |
| 14.769 | 6.695 |
| 14.7735 | 6.716 |
| 14.778 | 6.716 |
| 14.7825 | 6.737 |
| 14.787 | 6.737 |
| 14.7915 | 6.759 |
| 14.796 | 6.78 |
| 14.8005 | 6.78 |
| 14.805 | 6.802 |
| 14.8095 | 6.802 |
| 14.814 | 6.823 |
| 14.8185 | 6.823 |
| 14.823 | 6.845 |
| 14.8275 | 6.856 |
| 14.832 | 6.867 |
| 14.8365 | 6.888 |
| 14.841 | 6.888 |
| 14.8455 | 6.91 |
| 14.85 | 6.91 |
| 14.8545 | 6.932 |
| 14.859 | 6.932 |
| 14.8635 | 6.954 |
| 14.868 | 6.976 |
| 14.8725 | 6.976 |
| 14.877 | 6.999 |
| 14.8815 | 6.999 |
| 14.886 | 7.021 |
| 14.8905 | 7.021 |
| 14.895 | 7.043 |
| 14.8995 | 7.043 |
| 14.904 | 7.065 |
| 14.9085 | 7.088 |
| 14.913 | 7.088 |
| 14.9175 | 7.111 |
| 14.922 | 7.111 |
| 14.9265 | 7.134 |
| 14.931 | 7.134 |
| 14.9355 | 7.156 |
| 14.94 | 7.156 |
| 14.9445 | 7.179 |
| 14.949 | 7.202 |
| 14.9535 | 7.202 |
| 14.958 | 7.224 |
| 14.9625 | 7.224 |
| 14.967 | 7.247 |
| 14.9715 | 7.247 |
| 14.976 | 7.269 |
| 14.9805 | 7.292 |
| 14.985 | 7.292 |
| 14.9895 | 7.314 |
| 14.994 | 7.314 |
| 14.9985 | 7.336 |
| 15.003 | 7.336 |
| 15.0075 | 7.358 |
| 15.012 | 7.358 |
| 15.0165 | 7.38 |
| 15.021 | 7.402 |
| 15.0255 | 7.402 |
| 15.03 | 7.424 |
| 15.0345 | 7.424 |
| 15.039 | 7.446 |
| 15.0435 | 7.446 |
| 15.048 | 7.468 |
| 15.0525 | 7.468 |
| 15.057 | 7.49 |
| 15.0615 | 7.512 |
| 15.066 | 7.512 |
| 15.0705 | 7.534 |
| 15.075 | 7.534 |
| 15.0795 | 7.557 |
| 15.084 | 7.557 |
| 15.0885 | 7.579 |
| 15.093 | 7.579 |
| 15.0975 | 7.602 |
| 15.102 | 7.625 |
| 15.1065 | 7.625 |
| 15.111 | 7.648 |
| 15.1155 | 7.648 |
| 15.12 | 7.671 |
| 15.1245 | 7.671 |
| 15.129 | 7.694 |
| 15.1335 | 7.718 |
| 15.138 | 7.718 |
| 15.1425 | 7.741 |
| 15.147 | 7.741 |
| 15.1515 | 7.764 |
| 15.156 | 7.764 |
| 15.1605 | 7.787 |
| 15.165 | 7.787 |
| 15.1695 | 7.811 |
| 15.174 | 7.834 |
| 15.1785 | 7.834 |
| 15.183 | 7.857 |
| 15.1875 | 7.857 |
| 15.192 | 7.881 |
| 15.1965 | 7.881 |
| 15.201 | 7.904 |
| 15.2055 | 7.904 |
| 15.21 | 7.927 |
| 15.2145 | 7.951 |
| 15.219 | 7.951 |
| 15.2235 | 7.974 |
| 15.228 | 7.974 |
| 15.2325 | 7.998 |
| 15.237 | 7.998 |
| 15.2415 | 8.021 |
| 15.246 | 8.021 |
| 15.2505 | 8.045 |
| 15.255 | 8.069 |
| 15.2595 | 8.069 |
| 15.264 | 8.093 |
| 15.2685 | 8.093 |
| 15.273 | 8.117 |
| 15.2775 | 8.117 |
| 15.282 | 8.141 |
| 15.2865 | 8.165 |
| 15.291 | 8.165 |
| 15.2955 | 8.19 |
| 15.3 | 8.19 |
| 15.3045 | 8.216 |
| 15.309 | 8.216 |
| 15.3135 | 8.241 |
| 15.318 | 8.241 |
| 15.3225 | 8.267 |
| 15.327 | 8.293 |
| 15.3315 | 8.293 |
| 15.336 | 8.319 |
| 15.3405 | 8.319 |
| 15.345 | 8.345 |
| 15.3495 | 8.345 |
| 15.354 | 8.373 |
| 15.3585 | 8.373 |
| 15.363 | 8.4 |
| 15.3675 | 8.427 |
| 15.372 | 8.427 |
| 15.3765 | 8.455 |
| 15.381 | 8.455 |
| 15.3855 | 8.482 |
| 15.39 | 8.482 |
| 15.3945 | 8.51 |
| 15.399 | 8.523 |
| 15.4035 | 8.537 |
| 15.408 | 8.564 |
| 15.4125 | 8.564 |
| 15.417 | 8.592 |
| 15.4215 | 8.592 |
| 15.426 | 8.619 |
| 15.4305 | 8.619 |
| 15.435 | 8.646 |
| 15.4395 | 8.671 |
| 15.444 | 8.671 |
| 15.4485 | 8.696 |
| 15.453 | 8.696 |
| 15.4575 | 8.721 |
| 15.462 | 8.721 |
| 15.4665 | 8.746 |
| 15.471 | 8.746 |
| 15.4755 | 8.771 |
| 15.48 | 8.796 |
| 15.4845 | 8.796 |
| 15.489 | 8.819 |
| 15.4935 | 8.819 |
| 15.498 | 8.842 |
| 15.5025 | 8.842 |
| 15.507 | 8.865 |
| 15.5115 | 8.865 |
| 15.516 | 8.889 |
| 15.5205 | 8.912 |
| 15.525 | 8.912 |
| 15.5295 | 8.935 |
| 15.534 | 8.935 |
| 15.5385 | 8.958 |
| 15.543 | 8.958 |
| 15.5475 | 8.982 |
| 15.552 | 8.993 |
| 15.5565 | 9.005 |
| 15.561 | 9.028 |
| 15.5655 | 9.028 |
| 15.57 | 9.052 |
| 15.5745 | 9.052 |
| 15.579 | 9.076 |
| 15.5835 | 9.076 |
| 15.588 | 9.101 |
| 15.5925 | 9.125 |
| 15.597 | 9.125 |
| 15.6015 | 9.149 |
| 15.606 | 9.149 |
| 15.6105 | 9.174 |
| 15.615 | 9.174 |
| 15.6195 | 9.199 |
| 15.624 | 9.199 |
| 15.6285 | 9.224 |
| 15.633 | 9.25 |
| 15.6375 | 9.25 |
| 15.642 | 9.275 |
| 15.6465 | 9.275 |
| 15.651 | 9.301 |
| 15.6555 | 9.301 |
| 15.66 | 9.326 |
| 15.6645 | 9.326 |
| 15.669 | 9.352 |
| 15.6735 | 9.378 |
| 15.678 | 9.378 |
| 15.6825 | 9.404 |
| 15.687 | 9.404 |
| 15.6915 | 9.43 |
| 15.696 | 9.43 |
| 15.7005 | 9.456 |
| 15.705 | 9.482 |
| 15.7095 | 9.482 |
| 15.714 | 9.507 |
| 15.7185 | 9.507 |
| 15.723 | 9.533 |
| 15.7275 | 9.533 |
| 15.732 | 9.559 |
| 15.7365 | 9.559 |
| 15.741 | 9.584 |
| 15.7455 | 9.61 |
| 15.75 | 9.61 |
| 15.7545 | 9.636 |
| 15.759 | 9.636 |
| 15.7635 | 9.661 |
| 15.768 | 9.661 |
| 15.7725 | 9.686 |
| 15.777 | 9.686 |
| 15.7815 | 9.711 |
| 15.786 | 9.736 |
| 15.7905 | 9.736 |
| 15.795 | 9.761 |
| 15.7995 | 9.761 |
| 15.804 | 9.786 |
| 15.8085 | 9.786 |
| 15.813 | 9.811 |
| 15.8175 | 9.811 |
| 15.822 | 9.836 |
| 15.8265 | 9.862 |
| 15.831 | 9.862 |
| 15.8355 | 9.887 |
| 15.84 | 9.887 |
| 15.8445 | 9.912 |
| 15.849 | 9.912 |
| 15.8535 | 9.938 |
| 15.858 | 9.964 |
| 15.8625 | 9.964 |
| 15.867 | 9.991 |
| 15.8715 | 9.991 |
| 15.876 | 10.018 |
| 15.8805 | 10.018 |
| 15.885 | 10.046 |
| 15.8895 | 10.046 |
| 15.894 | 10.073 |
| 15.8985 | 10.1 |
| 15.903 | 10.1 |
| 15.9075 | 10.127 |
| 15.912 | 10.127 |
| 15.9165 | 10.155 |
| 15.921 | 10.155 |
| 15.9255 | 10.183 |
| 15.93 | 10.183 |
| 15.9345 | 10.211 |
| 15.939 | 10.238 |
| 15.9435 | 10.238 |
| 15.948 | 10.266 |
| 15.9525 | 10.266 |
| 15.957 | 10.293 |
| 15.9615 | 10.293 |
| 15.966 | 10.32 |
| 15.9705 | 10.333 |
| 15.975 | 10.346 |
| 15.9795 | 10.373 |
| 15.984 | 10.373 |
| 15.9885 | 10.399 |
| 15.993 | 10.399 |
| 15.9975 | 10.426 |
| 16.002 | 10.426 |
| 16.0065 | 10.452 |
| 16.011 | 10.478 |
| 16.0155 | 10.478 |
| 16.02 | 10.504 |
| 16.0245 | 10.504 |
| 16.029 | 10.531 |
| 16.0335 | 10.531 |
| 16.038 | 10.557 |
| 16.0425 | 10.557 |
| 16.047 | 10.583 |
| 16.0515 | 10.61 |
| 16.056 | 10.61 |
| 16.0605 | 10.637 |
| 16.065 | 10.637 |
| 16.0695 | 10.665 |
| 16.074 | 10.665 |
| 16.0785 | 10.692 |
| 16.083 | 10.692 |
| 16.0875 | 10.72 |
| 16.092 | 10.747 |
| 16.0965 | 10.747 |
| 16.101 | 10.775 |
| 16.1055 | 10.775 |
| 16.11 | 10.802 |
| 16.1145 | 10.802 |
| 16.119 | 10.83 |
| 16.1235 | 10.844 |
| 16.128 | 10.857 |
| 16.1325 | 10.885 |
| 16.137 | 10.885 |
| 16.1415 | 10.912 |
| 16.146 | 10.912 |
| 16.1505 | 10.939 |
| 16.155 | 10.939 |
| 16.1595 | 10.966 |
| 16.164 | 10.992 |
| 16.1685 | 10.992 |
| 16.173 | 11.019 |
| 16.1775 | 11.019 |
| 16.182 | 11.045 |
| 16.1865 | 11.045 |
| 16.191 | 11.071 |
| 16.1955 | 11.071 |
| 16.2 | 11.097 |
| 16.2045 | 11.124 |
| 16.209 | 11.124 |
| 16.2135 | 11.152 |
| 16.218 | 11.152 |
| 16.2225 | 11.181 |
| 16.227 | 11.181 |
| 16.2315 | 11.209 |
| 16.236 | 11.209 |
| 16.2405 | 11.237 |
| 16.245 | 11.265 |
| 16.2495 | 11.265 |
| 16.254 | 11.294 |
| 16.2585 | 11.294 |
| 16.263 | 11.326 |
| 16.2675 | 11.326 |
| 16.272 | 11.359 |
| 16.2765 | 11.392 |
| 16.281 | 11.392 |
| 16.2855 | 11.424 |
| 16.29 | 11.424 |
| 16.2945 | 11.457 |
| 16.299 | 11.457 |
| 16.3035 | 11.489 |
| 16.308 | 11.489 |
| 16.3125 | 11.522 |
| 16.317 | 11.555 |
| 16.3215 | 11.555 |
| 16.326 | 11.588 |
| 16.3305 | 11.588 |
| 16.335 | 11.621 |
| 16.3395 | 11.621 |
| 16.344 | 11.653 |
| 16.3485 | 11.653 |
| 16.353 | 11.686 |
| 16.3575 | 11.717 |
| 16.362 | 11.717 |
| 16.3665 | 11.744 |
| 16.371 | 11.744 |
| 16.3755 | 11.771 |
| 16.38 | 11.771 |
| 16.3845 | 11.798 |
| 16.389 | 11.798 |
| 16.3935 | 11.825 |
| 16.398 | 11.853 |
| 16.4025 | 11.853 |
| 16.407 | 11.879 |
| 16.4115 | 11.879 |
| 16.416 | 11.904 |
| 16.4205 | 11.904 |
| 16.425 | 11.928 |
| 16.4295 | 11.952 |
| 16.434 | 11.952 |
| 16.4385 | 11.976 |
| 16.443 | 11.976 |
| 16.4475 | 11.999 |
| 16.452 | 11.999 |
| 16.4565 | 12.023 |
| 16.461 | 12.023 |
| 16.4655 | 12.049 |
| 16.47 | 12.076 |
| 16.4745 | 12.076 |
| 16.479 | 12.103 |
| 16.4835 | 12.103 |
| 16.488 | 12.13 |
| 16.4925 | 12.13 |
| 16.497 | 12.158 |
| 16.5015 | 12.158 |
| 16.506 | 12.185 |
| 16.5105 | 12.213 |
| 16.515 | 12.213 |
| 16.5195 | 12.242 |
| 16.524 | 12.242 |
| 16.5285 | 12.272 |
| 16.533 | 12.272 |
| 16.5375 | 12.302 |
| 16.542 | 12.302 |
| 16.5465 | 12.332 |
| 16.551 | 12.362 |
| 16.5555 | 12.362 |
| 16.56 | 12.392 |
| 16.5645 | 12.392 |
| 16.569 | 12.422 |
| 16.5735 | 12.422 |
| 16.578 | 12.45 |
| 16.5825 | 12.478 |
| 16.587 | 12.478 |
| 16.5915 | 12.506 |
| 16.596 | 12.506 |
| 16.6005 | 12.534 |
| 16.605 | 12.534 |
| 16.6095 | 12.562 |
| 16.614 | 12.562 |
| 16.6185 | 12.59 |
| 16.623 | 12.617 |
| 16.6275 | 12.617 |
| 16.632 | 12.643 |
| 16.6365 | 12.643 |
| 16.641 | 12.669 |
| 16.6455 | 12.669 |
| 16.65 | 12.694 |
| 16.6545 | 12.694 |
| 16.659 | 12.72 |
| 16.6635 | 12.746 |
| 16.668 | 12.746 |
| 16.6725 | 12.772 |
| 16.677 | 12.772 |
| 16.6815 | 12.798 |
| 16.686 | 12.798 |
| 16.6905 | 12.825 |
| 16.695 | 12.838 |
| 16.6995 | 12.851 |
| 16.704 | 12.877 |
| 16.7085 | 12.877 |
| 16.713 | 12.903 |
| 16.7175 | 12.903 |
| 16.722 | 12.93 |
| 16.7265 | 12.93 |
| 16.731 | 12.956 |
| 16.7355 | 12.984 |
| 16.74 | 12.984 |
| 16.7445 | 13.011 |
| 16.749 | 13.011 |
| 16.7535 | 13.038 |
| 16.758 | 13.038 |
| 16.7625 | 13.065 |
| 16.767 | 13.065 |
| 16.7715 | 13.092 |
| 16.776 | 13.12 |
| 16.7805 | 13.12 |
| 16.785 | 13.148 |
| 16.7895 | 13.148 |
| 16.794 | 13.176 |
| 16.7985 | 13.176 |
| 16.803 | 13.205 |
| 16.8075 | 13.205 |
| 16.812 | 13.233 |
| 16.8165 | 13.261 |
| 16.821 | 13.261 |
| 16.8255 | 13.29 |
| 16.83 | 13.29 |
| 16.8345 | 13.319 |
| 16.839 | 13.319 |
| 16.8435 | 13.348 |
| 16.848 | 13.378 |
| 16.8525 | 13.378 |
| 16.857 | 13.408 |
| 16.8615 | 13.408 |
| 16.866 | 13.437 |
| 16.8705 | 13.437 |
| 16.875 | 13.467 |
| 16.8795 | 13.467 |
| 16.884 | 13.497 |
| 16.8885 | 13.527 |
| 16.893 | 13.527 |
| 16.8975 | 13.556 |
| 16.902 | 13.556 |
| 16.9065 | 13.586 |
| 16.911 | 13.586 |
| 16.9155 | 13.616 |
| 16.92 | 13.616 |
| 16.9245 | 13.646 |
| 16.929 | 13.675 |
| 16.9335 | 13.675 |
| 16.938 | 13.705 |
| 16.9425 | 13.705 |
| 16.947 | 13.734 |
| 16.9515 | 13.734 |
| 16.956 | 13.763 |
| 16.9605 | 13.763 |
| 16.965 | 13.792 |
| 16.9695 | 13.82 |
| 16.974 | 13.82 |
| 16.9785 | 13.849 |
| 16.983 | 13.849 |
| 16.9875 | 13.877 |
| 16.992 | 13.877 |
| 16.9965 | 13.906 |
| 17.001 | 13.934 |
| 17.0055 | 13.934 |
| 17.01 | 13.961 |
| 17.0145 | 13.961 |
| 17.019 | 13.988 |
| 17.0235 | 13.988 |
| 17.028 | 14.015 |
| 17.0325 | 14.015 |
| 17.037 | 14.041 |
| 17.0415 | 14.068 |
| 17.046 | 14.068 |
| 17.0505 | 14.095 |
| 17.055 | 14.095 |
| 17.0595 | 14.121 |
| 17.064 | 14.121 |
| 17.0685 | 14.146 |
| 17.073 | 14.146 |
| 17.0775 | 14.17 |
| 17.082 | 14.195 |
| 17.0865 | 14.195 |
| 17.091 | 14.219 |
| 17.0955 | 14.219 |
| 17.1 | 14.244 |
| 17.1045 | 14.244 |
| 17.109 | 14.269 |
| 17.1135 | 14.269 |
| 17.118 | 14.292 |
| 17.1225 | 14.315 |
| 17.127 | 14.315 |
| 17.1315 | 14.339 |
| 17.136 | 14.339 |
| 17.1405 | 14.362 |
| 17.145 | 14.362 |
| 17.1495 | 14.385 |
| 17.154 | 14.408 |
| 17.1585 | 14.408 |
| 17.163 | 14.431 |
| 17.1675 | 14.431 |
| 17.172 | 14.454 |
| 17.1765 | 14.454 |
| 17.181 | 14.478 |
| 17.1855 | 14.478 |
| 17.19 | 14.502 |
| 17.1945 | 14.525 |
| 17.199 | 14.525 |
| 17.2035 | 14.549 |
| 17.208 | 14.549 |
| 17.2125 | 14.573 |
| 17.217 | 14.573 |
| 17.2215 | 14.597 |
| 17.226 | 14.597 |
| 17.2305 | 14.621 |
| 17.235 | 14.645 |
| 17.2395 | 14.645 |
| 17.244 | 14.669 |
| 17.2485 | 14.669 |
| 17.253 | 14.693 |
| 17.2575 | 14.693 |
| 17.262 | 14.718 |
| 17.2665 | 14.73 |
| 17.271 | 14.742 |
| 17.2755 | 14.766 |
| 17.28 | 14.766 |
| 17.2845 | 14.789 |
| 17.289 | 14.789 |
| 17.2935 | 14.812 |
| 17.298 | 14.812 |
| 17.3025 | 14.834 |
| 17.307 | 14.856 |
| 17.3115 | 14.856 |
| 17.316 | 14.878 |
| 17.3205 | 14.878 |
| 17.325 | 14.9 |
| 17.3295 | 14.9 |
| 17.334 | 14.922 |
| 17.3385 | 14.922 |
| 17.343 | 14.943 |
| 17.3475 | 14.963 |
| 17.352 | 14.963 |
| 17.3565 | 14.982 |
| 17.361 | 14.982 |
| 17.3655 | 15.001 |
| 17.37 | 15.001 |
| 17.3745 | 15.02 |
| 17.379 | 15.02 |
| 17.3835 | 15.039 |
| 17.388 | 15.058 |
| 17.3925 | 15.058 |
| 17.397 | 15.077 |
| 17.4015 | 15.077 |
| 17.406 | 15.096 |
| 17.4105 | 15.096 |
| 17.415 | 15.115 |
| 17.4195 | 15.124 |
| 17.424 | 15.134 |
| 17.4285 | 15.152 |
| 17.433 | 15.152 |
| 17.4375 | 15.171 |
| 17.442 | 15.171 |
| 17.4465 | 15.19 |
| 17.451 | 15.19 |
| 17.4555 | 15.209 |
| 17.46 | 15.228 |
| 17.4645 | 15.228 |
| 17.469 | 15.249 |
| 17.4735 | 15.249 |
| 17.478 | 15.269 |
| 17.4825 | 15.269 |
| 17.487 | 15.29 |
| 17.4915 | 15.29 |
| 17.496 | 15.311 |
| 17.5005 | 15.331 |
| 17.505 | 15.331 |
| 17.5095 | 15.352 |
| 17.514 | 15.352 |
| 17.5185 | 15.372 |
| 17.523 | 15.372 |
| 17.5275 | 15.393 |
| 17.532 | 15.393 |
| 17.5365 | 15.413 |
| 17.541 | 15.434 |
| 17.5455 | 15.434 |
| 17.55 | 15.455 |
| 17.5545 | 15.455 |
| 17.559 | 15.475 |
| 17.5635 | 15.475 |
| 17.568 | 15.496 |
| 17.5725 | 15.516 |
| 17.577 | 15.516 |
| 17.5815 | 15.535 |
| 17.586 | 15.535 |
| 17.5905 | 15.554 |
| 17.595 | 15.554 |
| 17.5995 | 15.572 |
| 17.604 | 15.572 |
| 17.6085 | 15.59 |
| 17.613 | 15.608 |
| 17.6175 | 15.608 |
| 17.622 | 15.626 |
| 17.6265 | 15.626 |
| 17.631 | 15.644 |
| 17.6355 | 15.644 |
| 17.64 | 15.662 |
| 17.6445 | 15.662 |
| 17.649 | 15.678 |
| 17.6535 | 15.694 |
| 17.658 | 15.694 |
| 17.6625 | 15.71 |
| 17.667 | 15.71 |
| 17.6715 | 15.726 |
| 17.676 | 15.726 |
| 17.6805 | 15.742 |
| 17.685 | 15.742 |
| 17.6895 | 15.757 |
| 17.694 | 15.773 |
| 17.6985 | 15.773 |
| 17.703 | 15.79 |
| 17.7075 | 15.79 |
| 17.712 | 15.806 |
| 17.7165 | 15.806 |
| 17.721 | 15.823 |
| 17.7255 | 15.839 |
| 17.73 | 15.839 |
| 17.7345 | 15.856 |
| 17.739 | 15.856 |
| 17.7435 | 15.872 |
| 17.748 | 15.872 |
| 17.7525 | 15.888 |
| 17.757 | 15.888 |
| 17.7615 | 15.905 |
| 17.766 | 15.923 |
| 17.7705 | 15.923 |
| 17.775 | 15.942 |
| 17.7795 | 15.942 |
| 17.784 | 15.96 |
| 17.7885 | 15.96 |
| 17.793 | 15.978 |
| 17.7975 | 15.978 |
| 17.802 | 15.996 |
| 17.8065 | 16.014 |
| 17.811 | 16.014 |
| 17.8155 | 16.032 |
| 17.82 | 16.032 |
| 17.8245 | 16.049 |
| 17.829 | 16.049 |
| 17.8335 | 16.066 |
| 17.838 | 16.066 |
| 17.8425 | 16.083 |
| 17.847 | 16.1 |
| 17.8515 | 16.1 |
| 17.856 | 16.117 |
| 17.8605 | 16.117 |
| 17.865 | 16.134 |
| 17.8695 | 16.134 |
| 17.874 | 16.151 |
| 17.8785 | 16.168 |
| 17.883 | 16.168 |
| 17.8875 | 16.183 |
| 17.892 | 16.183 |
| 17.8965 | 16.197 |
| 17.901 | 16.197 |
| 17.9055 | 16.212 |
| 17.91 | 16.212 |
| 17.9145 | 16.226 |
| 17.919 | 16.241 |
| 17.9235 | 16.241 |
| 17.928 | 16.255 |
| 17.9325 | 16.255 |
| 17.937 | 16.27 |
| 17.9415 | 16.27 |
| 17.946 | 16.284 |
| 17.9505 | 16.284 |
| 17.955 | 16.298 |
| 17.9595 | 16.312 |
| 17.964 | 16.312 |
| 17.9685 | 16.326 |
| 17.973 | 16.326 |
| 17.9775 | 16.34 |
| 17.982 | 16.34 |
| 17.9865 | 16.354 |
| 17.991 | 16.361 |
| 17.9955 | 16.368 |
| 18.0 | 16.382 |
| 18.0045 | 16.382 |
| 18.009 | 16.397 |
| 18.0135 | 16.397 |
| 18.018 | 16.412 |
| 18.0225 | 16.412 |
| 18.027 | 16.427 |
| 18.0315 | 16.443 |
| 18.036 | 16.443 |
| 18.0405 | 16.458 |
| 18.045 | 16.458 |
| 18.0495 | 16.473 |
| 18.054 | 16.473 |
| 18.0585 | 16.488 |
| 18.063 | 16.488 |
| 18.0675 | 16.503 |
| 18.072 | 16.518 |
| 18.0765 | 16.518 |
| 18.081 | 16.534 |
| 18.0855 | 16.534 |
| 18.09 | 16.549 |
| 18.0945 | 16.549 |
| 18.099 | 16.564 |
| 18.1035 | 16.564 |
| 18.108 | 16.579 |
| 18.1125 | 16.595 |
| 18.117 | 16.595 |
| 18.1215 | 16.61 |
| 18.126 | 16.61 |
| 18.1305 | 16.625 |
| 18.135 | 16.625 |
| 18.1395 | 16.639 |
| 18.144 | 16.654 |
| 18.1485 | 16.654 |
| 18.153 | 16.668 |
| 18.1575 | 16.668 |
| 18.162 | 16.682 |
| 18.1665 | 16.682 |
| 18.171 | 16.697 |
| 18.1755 | 16.697 |
| 18.18 | 16.711 |
| 18.1845 | 16.725 |
| 18.189 | 16.725 |
| 18.1935 | 16.74 |
| 18.198 | 16.74 |
| 18.2025 | 16.755 |
| 18.207 | 16.755 |
| 18.2115 | 16.77 |
| 18.216 | 16.77 |
| 18.2205 | 16.785 |
| 18.225 | 16.8 |
| 18.2295 | 16.8 |
| 18.234 | 16.815 |
| 18.2385 | 16.815 |
| 18.243 | 16.829 |
| 18.2475 | 16.829 |
| 18.252 | 16.844 |
| 18.2565 | 16.844 |
| 18.261 | 16.86 |
| 18.2655 | 16.876 |
| 18.27 | 16.876 |
| 18.2745 | 16.893 |
| 18.279 | 16.893 |
| 18.2835 | 16.909 |
| 18.288 | 16.909 |
| 18.2925 | 16.926 |
| 18.297 | 16.943 |
| 18.3015 | 16.943 |
| 18.306 | 16.959 |
| 18.3105 | 16.959 |
| 18.315 | 16.976 |
| 18.3195 | 16.976 |
| 18.324 | 16.992 |
| 18.3285 | 16.992 |
| 18.333 | 17.009 |
| 18.3375 | 17.025 |
| 18.342 | 17.025 |
| 18.3465 | 17.042 |
| 18.351 | 17.042 |
| 18.3555 | 17.058 |
| 18.36 | 17.058 |
| 18.3645 | 17.074 |
| 18.369 | 17.074 |
| 18.3735 | 17.091 |
| 18.378 | 17.107 |
| 18.3825 | 17.107 |
| 18.387 | 17.123 |
| 18.3915 | 17.123 |
| 18.396 | 17.137 |
| 18.4005 | 17.137 |
| 18.405 | 17.15 |
| 18.4095 | 17.15 |
| 18.414 | 17.164 |
| 18.4185 | 17.177 |
| 18.423 | 17.177 |
| 18.4275 | 17.19 |
| 18.432 | 17.19 |
| 18.4365 | 17.204 |
| 18.441 | 17.204 |
| 18.4455 | 17.217 |
| 18.45 | 17.23 |
| 18.4545 | 17.23 |
| 18.459 | 17.241 |
| 18.4635 | 17.241 |
| 18.468 | 17.251 |
| 18.4725 | 17.251 |
| 18.477 | 17.261 |
| 18.4815 | 17.261 |
| 18.486 | 17.271 |
| 18.4905 | 17.282 |
| 18.495 | 17.282 |
| 18.4995 | 17.292 |
| 18.504 | 17.292 |
| 18.5085 | 17.302 |
| 18.513 | 17.302 |
| 18.5175 | 17.312 |
| 18.522 | 17.312 |
| 18.5265 | 17.323 |
| 18.531 | 17.334 |
| 18.5355 | 17.334 |
| 18.54 | 17.345 |
| 18.5445 | 17.345 |
| 18.549 | 17.355 |
| 18.5535 | 17.355 |
| 18.558 | 17.366 |
| 18.5625 | 17.371 |
| 18.567 | 17.377 |
| 18.5715 | 17.387 |
| 18.576 | 17.387 |
| 18.5805 | 17.398 |
| 18.585 | 17.398 |
| 18.5895 | 17.411 |
| 18.594 | 17.411 |
| 18.5985 | 17.426 |
| 18.603 | 17.44 |
| 18.6075 | 17.44 |
| 18.612 | 17.455 |
| 18.6165 | 17.455 |
| 18.621 | 17.469 |
| 18.6255 | 17.469 |
| 18.63 | 17.484 |
| 18.6345 | 17.484 |
| 18.639 | 17.498 |
| 18.6435 | 17.513 |
| 18.648 | 17.513 |
| 18.6525 | 17.529 |
| 18.657 | 17.529 |
| 18.6615 | 17.546 |
| 18.666 | 17.546 |
| 18.6705 | 17.564 |
| 18.675 | 17.564 |
| 18.6795 | 17.581 |
| 18.684 | 17.599 |
| 18.6885 | 17.599 |
| 18.693 | 17.617 |
| 18.6975 | 17.617 |
| 18.702 | 17.635 |
| 18.7065 | 17.635 |
| 18.711 | 17.652 |
| 18.7155 | 17.661 |
| 18.72 | 17.67 |
| 18.7245 | 17.687 |
| 18.729 | 17.687 |
| 18.7335 | 17.704 |
| 18.738 | 17.704 |
| 18.7425 | 17.721 |
| 18.747 | 17.721 |
| 18.7515 | 17.738 |
| 18.756 | 17.755 |
| 18.7605 | 17.755 |
| 18.765 | 17.772 |
| 18.7695 | 17.772 |
| 18.774 | 17.789 |
| 18.7785 | 17.789 |
| 18.783 | 17.805 |
| 18.7875 | 17.805 |
| 18.792 | 17.821 |
| 18.7965 | 17.835 |
| 18.801 | 17.835 |
| 18.8055 | 17.848 |
| 18.81 | 17.848 |
| 18.8145 | 17.862 |
| 18.819 | 17.862 |
| 18.8235 | 17.876 |
| 18.828 | 17.876 |
| 18.8325 | 17.89 |
| 18.837 | 17.904 |
| 18.8415 | 17.904 |
| 18.846 | 17.918 |
| 18.8505 | 17.918 |
| 18.855 | 17.931 |
| 18.8595 | 17.931 |
| 18.864 | 17.945 |
| 18.8685 | 17.958 |
| 18.873 | 17.958 |
| 18.8775 | 17.971 |
| 18.882 | 17.971 |
| 18.8865 | 17.984 |
| 18.891 | 17.984 |
| 18.8955 | 17.997 |
| 18.9 | 17.997 |
| 18.9045 | 18.01 |
| 18.909 | 18.023 |
| 18.9135 | 18.023 |
| 18.918 | 18.036 |
| 18.9225 | 18.036 |
| 18.927 | 18.05 |
| 18.9315 | 18.05 |
| 18.936 | 18.064 |
| 18.9405 | 18.064 |
| 18.945 | 18.078 |
| 18.9495 | 18.092 |
| 18.954 | 18.092 |
| 18.9585 | 18.106 |
| 18.963 | 18.106 |
| 18.9675 | 18.12 |
| 18.972 | 18.12 |
| 18.9765 | 18.134 |
| 18.981 | 18.134 |
| 18.9855 | 18.148 |
| 18.99 | 18.162 |
| 18.9945 | 18.162 |
| 18.999 | 18.174 |
| 19.0035 | 18.174 |
| 19.008 | 18.187 |
| 19.0125 | 18.187 |
| 19.017 | 18.199 |
| 19.0215 | 18.211 |
| 19.026 | 18.211 |
| 19.0305 | 18.223 |
| 19.035 | 18.223 |
| 19.0395 | 18.236 |
| 19.044 | 18.236 |
| 19.0485 | 18.248 |
| 19.053 | 18.248 |
| 19.0575 | 18.26 |
| 19.062 | 18.271 |
| 19.0665 | 18.271 |
| 19.071 | 18.282 |
| 19.0755 | 18.282 |
| 19.08 | 18.292 |
| 19.0845 | 18.292 |
| 19.089 | 18.302 |
| 19.0935 | 18.302 |
| 19.098 | 18.312 |
| 19.1025 | 18.322 |
| 19.107 | 18.322 |
| 19.1115 | 18.332 |
| 19.116 | 18.332 |
| 19.1205 | 18.342 |
| 19.125 | 18.342 |
| 19.1295 | 18.352 |
| 19.134 | 18.352 |
| 19.1385 | 18.363 |
| 19.143 | 18.375 |
| 19.1475 | 18.375 |
| 19.152 | 18.387 |
| 19.1565 | 18.387 |
| 19.161 | 18.4 |
| 19.1655 | 18.4 |
| 19.17 | 18.412 |
| 19.1745 | 18.425 |
| 19.179 | 18.425 |
| 19.1835 | 18.437 |
| 19.188 | 18.437 |
| 19.1925 | 18.449 |
| 19.197 | 18.449 |
| 19.2015 | 18.462 |
| 19.206 | 18.462 |
| 19.2105 | 18.477 |
| 19.215 | 18.494 |
| 19.2195 | 18.494 |
| 19.224 | 18.511 |
| 19.2285 | 18.511 |
| 19.233 | 18.529 |
| 19.2375 | 18.529 |
| 19.242 | 18.546 |
| 19.2465 | 18.546 |
| 19.251 | 18.563 |
| 19.2555 | 18.58 |
| 19.26 | 18.58 |
| 19.2645 | 18.597 |
| 19.269 | 18.597 |
| 19.2735 | 18.615 |
| 19.278 | 18.615 |
| 19.2825 | 18.633 |
| 19.287 | 18.642 |
| 19.2915 | 18.652 |
| 19.296 | 18.671 |
| 19.3005 | 18.671 |
| 19.305 | 18.69 |
| 19.3095 | 18.69 |
| 19.314 | 18.709 |
| 19.3185 | 18.709 |
| 19.323 | 18.728 |
| 19.3275 | 18.747 |
| 19.332 | 18.747 |
| 19.3365 | 18.766 |
| 19.341 | 18.766 |
| 19.3455 | 18.785 |
| 19.35 | 18.785 |
| 19.3545 | 18.803 |
| 19.359 | 18.803 |
| 19.3635 | 18.82 |
| 19.368 | 18.837 |
| 19.3725 | 18.837 |
| 19.377 | 18.854 |
| 19.3815 | 18.854 |
| 19.386 | 18.871 |
| 19.3905 | 18.871 |
| 19.395 | 18.888 |
| 19.3995 | 18.888 |
| 19.404 | 18.905 |
| 19.4085 | 18.922 |
| 19.413 | 18.922 |
| 19.4175 | 18.939 |
| 19.422 | 18.939 |
| 19.4265 | 18.954 |
| 19.431 | 18.954 |
| 19.4355 | 18.968 |
| 19.44 | 18.982 |
| 19.4445 | 18.982 |
| 19.449 | 18.996 |
| 19.4535 | 18.996 |
| 19.458 | 19.01 |
| 19.4625 | 19.01 |
| 19.467 | 19.024 |
| 19.4715 | 19.024 |
| 19.476 | 19.038 |
| 19.4805 | 19.052 |
| 19.485 | 19.052 |
| 19.4895 | 19.066 |
| 19.494 | 19.066 |
| 19.4985 | 19.079 |
| 19.503 | 19.079 |
| 19.5075 | 19.093 |
| 19.512 | 19.093 |
| 19.5165 | 19.106 |
| 19.521 | 19.119 |
| 19.5255 | 19.119 |
| 19.53 | 19.133 |
| 19.5345 | 19.133 |
| 19.539 | 19.146 |
| 19.5435 | 19.146 |
| 19.548 | 19.16 |
| 19.5525 | 19.16 |
| 19.557 | 19.173 |
| 19.5615 | 19.186 |
| 19.566 | 19.186 |
| 19.5705 | 19.201 |
| 19.575 | 19.201 |
| 19.5795 | 19.216 |
| 19.584 | 19.216 |
| 19.5885 | 19.231 |
| 19.593 | 19.246 |
| 19.5975 | 19.246 |
| 19.602 | 19.262 |
| 19.6065 | 19.262 |
| 19.611 | 19.277 |
| 19.6155 | 19.277 |
| 19.62 | 19.292 |
| 19.6245 | 19.292 |
| 19.629 | 19.307 |
| 19.6335 | 19.322 |
| 19.638 | 19.322 |
| 19.6425 | 19.338 |
| 19.647 | 19.338 |
| 19.6515 | 19.355 |
| 19.656 | 19.355 |
| 19.6605 | 19.372 |
| 19.665 | 19.372 |
| 19.6695 | 19.389 |
| 19.674 | 19.405 |
| 19.6785 | 19.405 |
| 19.683 | 19.422 |
| 19.6875 | 19.422 |
| 19.692 | 19.439 |
| 19.6965 | 19.439 |
| 19.701 | 19.456 |
| 19.7055 | 19.456 |
| 19.71 | 19.473 |
| 19.7145 | 19.49 |
| 19.719 | 19.49 |
| 19.7235 | 19.507 |
| 19.728 | 19.507 |
| 19.7325 | 19.524 |
| 19.737 | 19.524 |
| 19.7415 | 19.542 |
| 19.746 | 19.559 |
| 19.7505 | 19.559 |
| 19.755 | 19.577 |
| 19.7595 | 19.577 |
| 19.764 | 19.594 |
| 19.7685 | 19.594 |
| 19.773 | 19.612 |
| 19.7775 | 19.612 |
| 19.782 | 19.629 |
| 19.7865 | 19.646 |
| 19.791 | 19.646 |
| 19.7955 | 19.664 |
| 19.8 | 19.664 |
| 19.8045 | 19.682 |
| 19.809 | 19.682 |
| 19.8135 | 19.7 |
| 19.818 | 19.7 |
| 19.8225 | 19.719 |
| 19.827 | 19.737 |
| 19.8315 | 19.737 |
| 19.836 | 19.755 |
| 19.8405 | 19.755 |
| 19.845 | 19.773 |
| 19.8495 | 19.773 |
| 19.854 | 19.791 |
| 19.8585 | 19.8 |
| 19.863 | 19.809 |
| 19.8675 | 19.827 |
| 19.872 | 19.827 |
| 19.8765 | 19.845 |
| 19.881 | 19.845 |
| 19.8855 | 19.863 |
| 19.89 | 19.863 |
| 19.8945 | 19.882 |
| 19.899 | 19.9 |
| 19.9035 | 19.9 |
| 19.908 | 19.918 |
| 19.9125 | 19.918 |
| 19.917 | 19.936 |
| 19.9215 | 19.936 |
| 19.926 | 19.955 |
| 19.9305 | 19.955 |
| 19.935 | 19.973 |
| 19.9395 | 19.991 |
| 19.944 | 19.991 |
| 19.9485 | 20.008 |
| 19.953 | 20.008 |
| 19.9575 | 20.025 |
| 19.962 | 20.025 |
| 19.9665 | 20.041 |
| 19.971 | 20.041 |
| 19.9755 | 20.058 |
| 19.98 | 20.074 |
| 19.9845 | 20.074 |
| 19.989 | 20.091 |
| 19.9935 | 20.091 |
| 19.998 | 20.107 |
| 20.0025 | 20.107 |
| 20.007 | 20.124 |
| 20.0115 | 20.132 |
| 20.016 | 20.14 |
| 20.0205 | 20.156 |
| 20.025 | 20.156 |
| 20.0295 | 20.17 |
| 20.034 | 20.17 |
| 20.0385 | 20.184 |
| 20.043 | 20.184 |
| 20.0475 | 20.198 |
| 20.052 | 20.212 |
| 20.0565 | 20.212 |
| 20.061 | 20.226 |
| 20.0655 | 20.226 |
| 20.07 | 20.24 |
| 20.0745 | 20.24 |
| 20.079 | 20.253 |
| 20.0835 | 20.253 |
| 20.088 | 20.267 |
| 20.0925 | 20.281 |
| 20.097 | 20.281 |
| 20.1015 | 20.294 |
| 20.106 | 20.294 |
| 20.1105 | 20.308 |
| 20.115 | 20.308 |
| 20.1195 | 20.321 |
| 20.124 | 20.321 |
| 20.1285 | 20.335 |
| 20.133 | 20.348 |
| 20.1375 | 20.348 |
| 20.142 | 20.362 |
| 20.1465 | 20.362 |
| 20.151 | 20.375 |
| 20.1555 | 20.375 |
| 20.16 | 20.388 |
| 20.1645 | 20.402 |
| 20.169 | 20.402 |
| 20.1735 | 20.416 |
| 20.178 | 20.416 |
| 20.1825 | 20.431 |
| 20.187 | 20.431 |
| 20.1915 | 20.448 |
| 20.196 | 20.448 |
| 20.2005 | 20.465 |
| 20.205 | 20.481 |
| 20.2095 | 20.481 |
| 20.214 | 20.498 |
| 20.2185 | 20.498 |
| 20.223 | 20.515 |
| 20.2275 | 20.515 |
| 20.232 | 20.531 |
| 20.2365 | 20.531 |
| 20.241 | 20.548 |
| 20.2455 | 20.565 |
| 20.25 | 20.565 |
| 20.2545 | 20.583 |
| 20.259 | 20.583 |
| 20.2635 | 20.603 |
| 20.268 | 20.603 |
| 20.2725 | 20.624 |
| 20.277 | 20.624 |
| 20.2815 | 20.644 |
| 20.286 | 20.665 |
| 20.2905 | 20.665 |
| 20.295 | 20.686 |
| 20.2995 | 20.686 |
| 20.304 | 20.707 |
| 20.3085 | 20.707 |
| 20.313 | 20.727 |
| 20.3175 | 20.748 |
| 20.322 | 20.748 |
| 20.3265 | 20.769 |
| 20.331 | 20.769 |
| 20.3355 | 20.79 |
| 20.34 | 20.79 |
| 20.3445 | 20.813 |
| 20.349 | 20.813 |
| 20.3535 | 20.836 |
| 20.358 | 20.859 |
| 20.3625 | 20.859 |
| 20.367 | 20.882 |
| 20.3715 | 20.882 |
| 20.376 | 20.904 |
| 20.3805 | 20.904 |
| 20.385 | 20.927 |
| 20.3895 | 20.927 |
| 20.394 | 20.95 |
| 20.3985 | 20.973 |
| 20.403 | 20.973 |
| 20.4075 | 20.996 |
| 20.412 | 20.996 |
| 20.4165 | 21.018 |
| 20.421 | 21.018 |
| 20.4255 | 21.041 |
| 20.43 | 21.053 |
| 20.4345 | 21.064 |
| 20.439 | 21.087 |
| 20.4435 | 21.087 |
| 20.448 | 21.11 |
| 20.4525 | 21.11 |
| 20.457 | 21.133 |
| 20.4615 | 21.133 |
| 20.466 | 21.155 |
| 20.4705 | 21.178 |
| 20.475 | 21.178 |
| 20.4795 | 21.201 |
| 20.484 | 21.201 |
| 20.4885 | 21.224 |
| 20.493 | 21.224 |
| 20.4975 | 21.246 |
| 20.502 | 21.246 |
| 20.5065 | 21.268 |
| 20.511 | 21.289 |
| 20.5155 | 21.289 |
| 20.52 | 21.311 |
| 20.5245 | 21.311 |
| 20.529 | 21.332 |
| 20.5335 | 21.332 |
| 20.538 | 21.354 |
| 20.5425 | 21.354 |
| 20.547 | 21.375 |
| 20.5515 | 21.397 |
| 20.556 | 21.397 |
| 20.5605 | 21.418 |
| 20.565 | 21.418 |
| 20.5695 | 21.439 |
| 20.574 | 21.439 |
| 20.5785 | 21.46 |
| 20.583 | 21.47 |
| 20.5875 | 21.48 |
| 20.592 | 21.499 |
| 20.5965 | 21.499 |
| 20.601 | 21.519 |
| 20.6055 | 21.519 |
| 20.61 | 21.538 |
| 20.6145 | 21.538 |
| 20.619 | 21.558 |
| 20.6235 | 21.577 |
| 20.628 | 21.577 |
| 20.6325 | 21.597 |
| 20.637 | 21.597 |
| 20.6415 | 21.616 |
| 20.646 | 21.616 |
| 20.6505 | 21.635 |
| 20.655 | 21.635 |
| 20.6595 | 21.654 |
| 20.664 | 21.673 |
| 20.6685 | 21.673 |
| 20.673 | 21.691 |
| 20.6775 | 21.691 |
| 20.682 | 21.709 |
| 20.6865 | 21.709 |
| 20.691 | 21.727 |
| 20.6955 | 21.727 |
| 20.7 | 21.746 |
| 20.7045 | 21.764 |
| 20.709 | 21.764 |
| 20.7135 | 21.782 |
| 20.718 | 21.782 |
| 20.7225 | 21.8 |
| 20.727 | 21.8 |
| 20.7315 | 21.818 |
| 20.736 | 21.836 |
| 20.7405 | 21.836 |
| 20.745 | 21.855 |
| 20.7495 | 21.855 |
| 20.754 | 21.874 |
| 20.7585 | 21.874 |
| 20.763 | 21.893 |
| 20.7675 | 21.893 |
| 20.772 | 21.912 |
| 20.7765 | 21.931 |
| 20.781 | 21.931 |
| 20.7855 | 21.95 |
| 20.79 | 21.95 |
| 20.7945 | 21.969 |
| 20.799 | 21.969 |
| 20.8035 | 21.989 |
| 20.808 | 21.989 |
| 20.8125 | 22.008 |
| 20.817 | 22.027 |
| 20.8215 | 22.027 |
| 20.826 | 22.047 |
| 20.8305 | 22.047 |
| 20.835 | 22.068 |
| 20.8395 | 22.068 |
| 20.844 | 22.09 |
| 20.8485 | 22.09 |
| 20.853 | 22.112 |
| 20.8575 | 22.134 |
| 20.862 | 22.134 |
| 20.8665 | 22.156 |
| 20.871 | 22.156 |
| 20.8755 | 22.177 |
| 20.88 | 22.177 |
| 20.8845 | 22.199 |
| 20.889 | 22.221 |
| 20.8935 | 22.221 |
| 20.898 | 22.242 |
| 20.9025 | 22.242 |
| 20.907 | 22.265 |
| 20.9115 | 22.265 |
| 20.916 | 22.288 |
| 20.9205 | 22.288 |
| 20.925 | 22.312 |
| 20.9295 | 22.335 |
| 20.934 | 22.335 |
| 20.9385 | 22.359 |
| 20.943 | 22.359 |
| 20.9475 | 22.383 |
| 20.952 | 22.383 |
| 20.9565 | 22.407 |
| 20.961 | 22.407 |
| 20.9655 | 22.43 |
| 20.97 | 22.454 |
| 20.9745 | 22.454 |
| 20.979 | 22.478 |
| 20.9835 | 22.478 |
| 20.988 | 22.501 |
| 20.9925 | 22.501 |
| 20.997 | 22.525 |
| 21.0015 | 22.525 |
| 21.006 | 22.548 |
| 21.0105 | 22.571 |
| 21.015 | 22.571 |
| 21.0195 | 22.594 |
| 21.024 | 22.594 |
| 21.0285 | 22.617 |
| 21.033 | 22.617 |
| 21.0375 | 22.639 |
| 21.042 | 22.662 |
| 21.0465 | 22.662 |
| 21.051 | 22.685 |
| 21.0555 | 22.685 |
| 21.06 | 22.708 |
| 21.0645 | 22.708 |
| 21.069 | 22.731 |
| 21.0735 | 22.731 |
| 21.078 | 22.753 |
| 21.0825 | 22.774 |
| 21.087 | 22.774 |
| 21.0915 | 22.794 |
| 21.096 | 22.794 |
| 21.1005 | 22.814 |
| 21.105 | 22.814 |
| 21.1095 | 22.834 |
| 21.114 | 22.834 |
| 21.1185 | 22.854 |
| 21.123 | 22.874 |
| 21.1275 | 22.874 |
| 21.132 | 22.894 |
| 21.1365 | 22.894 |
| 21.141 | 22.914 |
| 21.1455 | 22.914 |
| 21.15 | 22.934 |
| 21.1545 | 22.944 |
| 21.159 | 22.953 |
| 21.1635 | 22.973 |
| 21.168 | 22.973 |
| 21.1725 | 22.992 |
| 21.177 | 22.992 |
| 21.1815 | 23.01 |
| 21.186 | 23.01 |
| 21.1905 | 23.029 |
| 21.195 | 23.048 |
| 21.1995 | 23.048 |
| 21.204 | 23.066 |
| 21.2085 | 23.066 |
| 21.213 | 23.085 |
| 21.2175 | 23.085 |
| 21.222 | 23.103 |
| 21.2265 | 23.103 |
| 21.231 | 23.122 |
| 21.2355 | 23.14 |
| 21.24 | 23.14 |
| 21.2445 | 23.159 |
| 21.249 | 23.159 |
| 21.2535 | 23.178 |
| 21.258 | 23.178 |
| 21.2625 | 23.198 |
| 21.267 | 23.198 |
| 21.2715 | 23.218 |
| 21.276 | 23.238 |
| 21.2805 | 23.238 |
| 21.285 | 23.258 |
| 21.2895 | 23.258 |
| 21.294 | 23.278 |
| 21.2985 | 23.278 |
| 21.303 | 23.298 |
| 21.3075 | 23.308 |
| 21.312 | 23.318 |
| 21.3165 | 23.338 |
| 21.321 | 23.338 |
| 21.3255 | 23.358 |
| 21.33 | 23.358 |
| 21.3345 | 23.378 |
| 21.339 | 23.378 |
| 21.3435 | 23.398 |
| 21.348 | 23.419 |
| 21.3525 | 23.419 |
| 21.357 | 23.439 |
| 21.3615 | 23.439 |
| 21.366 | 23.46 |
| 21.3705 | 23.46 |
| 21.375 | 23.48 |
| 21.3795 | 23.48 |
| 21.384 | 23.501 |
| 21.3885 | 23.521 |
| 21.393 | 23.521 |
| 21.3975 | 23.542 |
| 21.402 | 23.542 |
| 21.4065 | 23.562 |
| 21.411 | 23.562 |
| 21.4155 | 23.583 |
| 21.42 | 23.583 |
| 21.4245 | 23.603 |
| 21.429 | 23.622 |
| 21.4335 | 23.622 |
| 21.438 | 23.641 |
| 21.4425 | 23.641 |
| 21.447 | 23.659 |
| 21.4515 | 23.659 |
| 21.456 | 23.677 |
| 21.4605 | 23.696 |
| 21.465 | 23.696 |
| 21.4695 | 23.714 |
| 21.474 | 23.714 |
| 21.4785 | 23.732 |
| 21.483 | 23.732 |
| 21.4875 | 23.75 |
| 21.492 | 23.75 |
| 21.4965 | 23.769 |
| 21.501 | 23.787 |
| 21.5055 | 23.787 |
| 21.51 | 23.805 |
| 21.5145 | 23.805 |
| 21.519 | 23.823 |
| 21.5235 | 23.823 |
| 21.528 | 23.84 |
| 21.5325 | 23.84 |
| 21.537 | 23.857 |
| 21.5415 | 23.874 |
| 21.546 | 23.874 |
| 21.5505 | 23.891 |
| 21.555 | 23.891 |
| 21.5595 | 23.908 |
| 21.564 | 23.908 |
| 21.5685 | 23.925 |
| 21.573 | 23.925 |
| 21.5775 | 23.942 |
| 21.582 | 23.959 |
| 21.5865 | 23.959 |
| 21.591 | 23.976 |
| 21.5955 | 23.976 |
| 21.6 | 23.993 |
| 21.6045 | 23.993 |
| 21.609 | 24.01 |
| 21.6135 | 24.028 |
| 21.618 | 24.028 |
| 21.6225 | 24.046 |
| 21.627 | 24.046 |
| 21.6315 | 24.063 |
| 21.636 | 24.063 |
| 21.6405 | 24.081 |
| 21.645 | 24.081 |
| 21.6495 | 24.099 |
| 21.654 | 24.117 |
| 21.6585 | 24.117 |
| 21.663 | 24.135 |
| 21.6675 | 24.135 |
| 21.672 | 24.152 |
| 21.6765 | 24.152 |
| 21.681 | 24.17 |
| 21.6855 | 24.17 |
| 21.69 | 24.188 |
| 21.6945 | 24.205 |
| 21.699 | 24.205 |
| 21.7035 | 24.222 |
| 21.708 | 24.222 |
| 21.7125 | 24.239 |
| 21.717 | 24.239 |
| 21.7215 | 24.256 |
| 21.726 | 24.265 |
| 21.7305 | 24.273 |
| 21.735 | 24.29 |
| 21.7395 | 24.29 |
| 21.744 | 24.307 |
| 21.7485 | 24.307 |
| 21.753 | 24.324 |
| 21.7575 | 24.324 |
| 21.762 | 24.341 |
| 21.7665 | 24.358 |
| 21.771 | 24.358 |
| 21.7755 | 24.375 |
| 21.78 | 24.375 |
| 21.7845 | 24.391 |
| 21.789 | 24.391 |
| 21.7935 | 24.407 |
| 21.798 | 24.407 |
| 21.8025 | 24.421 |
| 21.807 | 24.436 |
| 21.8115 | 24.436 |
| 21.816 | 24.45 |
| 21.8205 | 24.45 |
| 21.825 | 24.465 |
| 21.8295 | 24.465 |
| 21.834 | 24.48 |
| 21.8385 | 24.48 |
| 21.843 | 24.494 |
| 21.8475 | 24.509 |
| 21.852 | 24.509 |
| 21.8565 | 24.523 |
| 21.861 | 24.523 |
| 21.8655 | 24.538 |
| 21.87 | 24.538 |
| 21.8745 | 24.552 |
| 21.879 | 24.559 |
| 21.8835 | 24.566 |
| 21.888 | 24.58 |
| 21.8925 | 24.58 |
| 21.897 | 24.593 |
| 21.9015 | 24.593 |
| 21.906 | 24.607 |
| 21.9105 | 24.607 |
| 21.915 | 24.62 |
| 21.9195 | 24.634 |
| 21.924 | 24.634 |
| 21.9285 | 24.647 |
| 21.933 | 24.647 |
| 21.9375 | 24.661 |
| 21.942 | 24.661 |
| 21.9465 | 24.674 |
| 21.951 | 24.674 |
| 21.9555 | 24.688 |
| 21.96 | 24.701 |
| 21.9645 | 24.701 |
| 21.969 | 24.714 |
| 21.9735 | 24.714 |
| 21.978 | 24.727 |
| 21.9825 | 24.727 |
| 21.987 | 24.739 |
| 21.9915 | 24.739 |
| 21.996 | 24.751 |
| 22.0005 | 24.763 |
| 22.005 | 24.763 |
| 22.0095 | 24.775 |
| 22.014 | 24.775 |
| 22.0185 | 24.787 |
| 22.023 | 24.787 |
| 22.0275 | 24.799 |
| 22.032 | 24.811 |
| 22.0365 | 24.811 |
| 22.041 | 24.823 |
| 22.0455 | 24.823 |
| 22.05 | 24.835 |
| 22.0545 | 24.835 |
| 22.059 | 24.847 |
| 22.0635 | 24.847 |
| 22.068 | 24.858 |
| 22.0725 | 24.868 |
| 22.077 | 24.868 |
| 22.0815 | 24.876 |
| 22.086 | 24.876 |
| 22.0905 | 24.886 |
| 22.095 | 24.886 |
| 22.0995 | 24.894 |
| 22.104 | 24.894 |
| 22.1085 | 24.904 |
| 22.113 | 24.912 |
| 22.1175 | 24.912 |
| 22.122 | 24.922 |
| 22.1265 | 24.922 |
| 22.131 | 24.93 |
| 22.1355 | 24.93 |
| 22.14 | 24.94 |
| 22.1445 | 24.94 |
| 22.149 | 24.948 |
| 22.1535 | 24.957 |
| 22.158 | 24.957 |
| 22.1625 | 24.966 |
| 22.167 | 24.966 |
| 22.1715 | 24.974 |
| 22.176 | 24.974 |
| 22.1805 | 24.983 |
| 22.185 | 24.991 |
| 22.1895 | 24.991 |
| 22.194 | 24.999 |
| 22.1985 | 24.999 |
| 22.203 | 25.007 |
| 22.2075 | 25.007 |
| 22.212 | 25.016 |
| 22.2165 | 25.016 |
| 22.221 | 25.024 |
| 22.2255 | 25.032 |
| 22.23 | 25.032 |
| 22.2345 | 25.04 |
| 22.239 | 25.04 |
| 22.2435 | 25.049 |
| 22.248 | 25.049 |
| 22.2525 | 25.057 |
| 22.257 | 25.057 |
| 22.2615 | 25.066 |
| 22.266 | 25.076 |
| 22.2705 | 25.076 |
| 22.275 | 25.086 |
| 22.2795 | 25.086 |
| 22.284 | 25.096 |
| 22.2885 | 25.096 |
| 22.293 | 25.107 |
| 22.2975 | 25.107 |
| 22.302 | 25.117 |
| 22.3065 | 25.127 |
| 22.311 | 25.127 |
| 22.3155 | 25.137 |
| 22.32 | 25.137 |
| 22.3245 | 25.147 |
| 22.329 | 25.147 |
| 22.3335 | 25.157 |
| 22.338 | 25.167 |
| 22.3425 | 25.167 |
| 22.347 | 25.177 |
| 22.3515 | 25.177 |
| 22.356 | 25.186 |
| 22.3605 | 25.186 |
| 22.365 | 25.196 |
| 22.3695 | 25.196 |
| 22.374 | 25.206 |
| 22.3785 | 25.215 |
| 22.383 | 25.215 |
| 22.3875 | 25.225 |
| 22.392 | 25.225 |
| 22.3965 | 25.235 |
| 22.401 | 25.235 |
| 22.4055 | 25.245 |
| 22.41 | 25.245 |
| 22.4145 | 25.254 |
| 22.419 | 25.264 |
| 22.4235 | 25.264 |
| 22.428 | 25.274 |
| 22.4325 | 25.274 |
| 22.437 | 25.283 |
| 22.4415 | 25.283 |
| 22.446 | 25.292 |
| 22.4505 | 25.297 |
| 22.455 | 25.3 |
| 22.4595 | 25.307 |
| 22.464 | 25.307 |
| 22.4685 | 25.314 |
| 22.473 | 25.314 |
| 22.4775 | 25.321 |
| 22.482 | 25.321 |
| 22.4865 | 25.328 |
| 22.491 | 25.334 |
| 22.4955 | 25.334 |
| 22.5 | 25.341 |
| 22.5045 | 25.341 |
| 22.509 | 25.348 |
| 22.5135 | 25.348 |
| 22.518 | 25.355 |
| 22.5225 | 25.355 |
| 22.527 | 25.362 |
| 22.5315 | 25.368 |
| 22.536 | 25.368 |
| 22.5405 | 25.375 |
| 22.545 | 25.375 |
| 22.5495 | 25.382 |
| 22.554 | 25.382 |
| 22.5585 | 25.388 |
| 22.563 | 25.388 |
| 22.5675 | 25.395 |
| 22.572 | 25.401 |
| 22.5765 | 25.401 |
| 22.581 | 25.408 |
| 22.5855 | 25.408 |
| 22.59 | 25.414 |
| 22.5945 | 25.414 |
| 22.599 | 25.42 |
| 22.6035 | 25.424 |
| 22.608 | 25.427 |
| 22.6125 | 25.433 |
| 22.617 | 25.433 |
| 22.6215 | 25.44 |
| 22.626 | 25.44 |
| 22.6305 | 25.446 |
| 22.635 | 25.446 |
| 22.6395 | 25.452 |
| 22.644 | 25.46 |
| 22.6485 | 25.46 |
| 22.653 | 25.469 |
| 22.6575 | 25.469 |
| 22.662 | 25.478 |
| 22.6665 | 25.478 |
| 22.671 | 25.487 |
| 22.6755 | 25.487 |
| 22.68 | 25.496 |
| 22.6845 | 25.505 |
| 22.689 | 25.505 |
| 22.6935 | 25.514 |
| 22.698 | 25.514 |
| 22.7025 | 25.523 |
| 22.707 | 25.523 |
| 22.7115 | 25.532 |
| 22.716 | 25.532 |
| 22.7205 | 25.541 |
| 22.725 | 25.55 |
| 22.7295 | 25.55 |
| 22.734 | 25.559 |
| 22.7385 | 25.559 |
| 22.743 | 25.568 |
| 22.7475 | 25.568 |
| 22.752 | 25.578 |
| 22.7565 | 25.589 |
| 22.761 | 25.589 |
| 22.7655 | 25.599 |
| 22.77 | 25.599 |
| 22.7745 | 25.61 |
| 22.779 | 25.61 |
| 22.7835 | 25.62 |
| 22.788 | 25.62 |
| 22.7925 | 25.631 |
| 22.797 | 25.641 |
| 22.8015 | 25.641 |
| 22.806 | 25.652 |
| 22.8105 | 25.652 |
| 22.815 | 25.662 |
| 22.8195 | 25.662 |
| 22.824 | 25.673 |
| 22.8285 | 25.673 |
| 22.833 | 25.683 |
| 22.8375 | 25.693 |
| 22.842 | 25.693 |
| 22.8465 | 25.702 |
| 22.851 | 25.702 |
| 22.8555 | 25.711 |
| 22.86 | 25.711 |
| 22.8645 | 25.719 |
| 22.869 | 25.719 |
| 22.8735 | 25.727 |
| 22.878 | 25.735 |
| 22.8825 | 25.735 |
| 22.887 | 25.743 |
| 22.8915 | 25.743 |
| 22.896 | 25.752 |
| 22.9005 | 25.752 |
| 22.905 | 25.76 |
| 22.9095 | 25.768 |
| 22.914 | 25.768 |
| 22.9185 | 25.776 |
| 22.923 | 25.776 |
| 22.9275 | 25.784 |
| 22.932 | 25.784 |
| 22.9365 | 25.793 |
| 22.941 | 25.793 |
| 22.9455 | 25.799 |
| 22.95 | 25.803 |
| 22.9545 | 25.803 |
| 22.959 | 25.806 |
| 22.9635 | 25.806 |
| 22.968 | 25.809 |
| 22.9725 | 25.809 |
| 22.977 | 25.812 |
| 22.9815 | 25.812 |
| 22.986 | 25.815 |
| 22.9905 | 25.818 |
| 22.995 | 25.818 |
| 22.9995 | 25.822 |
| 23.004 | 25.822 |
| 23.0085 | 25.825 |
| 23.013 | 25.825 |
| 23.0175 | 25.828 |
| 23.022 | 25.829 |
| 23.0265 | 25.831 |
| 23.031 | 25.834 |
| 23.0355 | 25.834 |
| 23.04 | 25.837 |
| 23.0445 | 25.837 |
| 23.049 | 25.838 |
| 23.0535 | 25.838 |
| 23.058 | 25.838 |
| 23.0625 | 25.838 |
| 23.067 | 25.838 |
| 23.0715 | 25.838 |
| 23.076 | 25.838 |
| 23.0805 | 25.838 |
| 23.085 | 25.838 |
| 23.0895 | 25.838 |
| 23.094 | 25.838 |
| 23.0985 | 25.838 |
| 23.103 | 25.838 |
| 23.1075 | 25.838 |
| 23.112 | 25.838 |
| 23.1165 | 25.838 |
| 23.121 | 25.838 |
| 23.1255 | 25.838 |
| 23.13 | 25.838 |
| 23.1345 | 25.838 |
| 23.139 | 25.838 |
| 23.1435 | 25.838 |
| 23.148 | 25.838 |
| 23.1525 | 25.84 |
| 23.157 | 25.84 |
| 23.1615 | 25.842 |
| 23.166 | 25.842 |
| 23.1705 | 25.844 |
| 23.175 | 25.845 |
| 23.1795 | 25.846 |
| 23.184 | 25.848 |
| 23.1885 | 25.848 |
| 23.193 | 25.85 |
| 23.1975 | 25.85 |
| 23.202 | 25.852 |
| 23.2065 | 25.852 |
| 23.211 | 25.854 |
| 23.2155 | 25.856 |
| 23.22 | 25.856 |
| 23.2245 | 25.858 |
| 23.229 | 25.858 |
| 23.2335 | 25.86 |
| 23.238 | 25.86 |
| 23.2425 | 25.862 |
| 23.247 | 25.862 |
| 23.2515 | 25.864 |
| 23.256 | 25.868 |
| 23.2605 | 25.868 |
| 23.265 | 25.873 |
| 23.2695 | 25.873 |
| 23.274 | 25.878 |
| 23.2785 | 25.878 |
| 23.283 | 25.884 |
| 23.2875 | 25.884 |
| 23.292 | 25.889 |
| 23.2965 | 25.894 |
| 23.301 | 25.894 |
| 23.3055 | 25.899 |
| 23.31 | 25.899 |
| 23.3145 | 25.904 |
| 23.319 | 25.904 |
| 23.3235 | 25.909 |
| 23.328 | 25.914 |
| 23.3325 | 25.914 |
| 23.337 | 25.919 |
| 23.3415 | 25.919 |
| 23.346 | 25.924 |
| 23.3505 | 25.924 |
| 23.355 | 25.929 |
| 23.3595 | 25.929 |
| 23.364 | 25.935 |
| 23.3685 | 25.941 |
| 23.373 | 25.941 |
| 23.3775 | 25.947 |
| 23.382 | 25.947 |
| 23.3865 | 25.953 |
| 23.391 | 25.953 |
| 23.3955 | 25.958 |
| 23.4 | 25.958 |
| 23.4045 | 25.964 |
| 23.409 | 25.97 |
| 23.4135 | 25.97 |
| 23.418 | 25.976 |
| 23.4225 | 25.976 |
| 23.427 | 25.982 |
| 23.4315 | 25.982 |
| 23.436 | 25.988 |
| 23.4405 | 25.988 |
| 23.445 | 25.994 |
| 23.4495 | 26 |
| 23.454 | 26 |
| 23.4585 | 26.006 |
| 23.463 | 26.006 |
| 23.4675 | 26.011 |
| 23.472 | 26.011 |
| 23.4765 | 26.017 |
| 23.481 | 26.022 |
| 23.4855 | 26.022 |
| 23.49 | 26.028 |
| 23.4945 | 26.028 |
| 23.499 | 26.034 |
| 23.5035 | 26.034 |
| 23.508 | 26.039 |
| 23.5125 | 26.039 |
| 23.517 | 26.045 |
| 23.5215 | 26.05 |
| 23.526 | 26.05 |
| 23.5305 | 26.056 |
| 23.535 | 26.056 |
| 23.5395 | 26.062 |
| 23.544 | 26.062 |
| 23.5485 | 26.067 |
| 23.553 | 26.067 |
| 23.5575 | 26.073 |
| 23.562 | 26.078 |
| 23.5665 | 26.078 |
| 23.571 | 26.084 |
| 23.5755 | 26.084 |
| 23.58 | 26.089 |
| 23.5845 | 26.089 |
| 23.589 | 26.094 |
| 23.5935 | 26.094 |
| 23.598 | 26.099 |
| 23.6025 | 26.104 |
| 23.607 | 26.104 |
| 23.6115 | 26.109 |
| 23.616 | 26.109 |
| 23.6205 | 26.115 |
| 23.625 | 26.115 |
| 23.6295 | 26.12 |
| 23.634 | 26.125 |
| 23.6385 | 26.125 |
| 23.643 | 26.13 |
| 23.6475 | 26.13 |
| 23.652 | 26.135 |
| 23.6565 | 26.135 |
| 23.661 | 26.14 |
| 23.6655 | 26.14 |
| 23.67 | 26.145 |
| 23.6745 | 26.15 |
| 23.679 | 26.15 |
| 23.6835 | 26.153 |
| 23.688 | 26.153 |
| 23.6925 | 26.156 |
| 23.697 | 26.156 |
| 23.7015 | 26.159 |
| 23.706 | 26.159 |
| 23.7105 | 26.162 |
| 23.715 | 26.164 |
| 23.7195 | 26.164 |
| 23.724 | 26.167 |
| 23.7285 | 26.167 |
| 23.733 | 26.17 |
| 23.7375 | 26.17 |
| 23.742 | 26.173 |
| 23.7465 | 26.174 |
| 23.751 | 26.176 |
| 23.7555 | 26.179 |
| 23.76 | 26.179 |
| 23.7645 | 26.182 |
| 23.769 | 26.182 |
| 23.7735 | 26.184 |
| 23.778 | 26.184 |
| 23.7825 | 26.187 |
| 23.787 | 26.189 |
| 23.7915 | 26.189 |
| 23.796 | 26.189 |
| 23.8005 | 26.189 |
| 23.805 | 26.189 |
| 23.8095 | 26.189 |
| 23.814 | 26.189 |
| 23.8185 | 26.189 |
| 23.823 | 26.19 |
| 23.8275 | 26.19 |
| 23.832 | 26.19 |
| 23.8365 | 26.19 |
| 23.841 | 26.19 |
| 23.8455 | 26.19 |
| 23.85 | 26.19 |
| 23.8545 | 26.191 |
| 23.859 | 26.191 |
| 23.8635 | 26.191 |
| 23.868 | 26.191 |
| 23.8725 | 26.191 |
| 23.877 | 26.191 |
| 23.8815 | 26.191 |
| 23.886 | 26.191 |
| 23.8905 | 26.191 |
| 23.895 | 26.192 |
| 23.8995 | 26.192 |
| 23.904 | 26.193 |
| 23.9085 | 26.194 |
| 23.913 | 26.194 |
| 23.9175 | 26.195 |
| 23.922 | 26.195 |
| 23.9265 | 26.196 |
| 23.931 | 26.196 |
| 23.9355 | 26.197 |
| 23.94 | 26.198 |
| 23.9445 | 26.198 |
| 23.949 | 26.199 |
| 23.9535 | 26.199 |
| 23.958 | 26.2 |
| 23.9625 | 26.2 |
| 23.967 | 26.201 |
| 23.9715 | 26.201 |
| 23.976 | 26.202 |
| 23.9805 | 26.203 |
| 23.985 | 26.203 |
| 23.9895 | 26.204 |
| 23.994 | 26.204 |
| 23.9985 | 26.205 |
| 24.003 | 26.205 |
| 24.0075 | 26.208 |
| 24.012 | 26.208 |
| 24.0165 | 26.212 |
| 24.021 | 26.216 |
| 24.0255 | 26.216 |
| 24.03 | 26.221 |
| 24.0345 | 26.221 |
| 24.039 | 26.226 |
| 24.0435 | 26.226 |
| 24.048 | 26.231 |
| 24.0525 | 26.235 |
| 24.057 | 26.235 |
| 24.0615 | 26.24 |
| 24.066 | 26.24 |
| 24.0705 | 26.245 |
| 24.075 | 26.245 |
| 24.0795 | 26.25 |
| 24.084 | 26.25 |
| 24.0885 | 26.254 |
| 24.093 | 26.259 |
| 24.0975 | 26.259 |
| 24.102 | 26.264 |
| 24.1065 | 26.264 |
| 24.111 | 26.269 |
| 24.1155 | 26.269 |
| 24.12 | 26.274 |
| 24.1245 | 26.274 |
| 24.129 | 26.281 |
| 24.1335 | 26.287 |
| 24.138 | 26.287 |
| 24.1425 | 26.294 |
| 24.147 | 26.294 |
| 24.1515 | 26.301 |
| 24.156 | 26.301 |
| 24.1605 | 26.307 |
| 24.165 | 26.307 |
| 24.1695 | 26.314 |
| 24.174 | 26.321 |
| 24.1785 | 26.321 |
| 24.183 | 26.327 |
| 24.1875 | 26.327 |
| 24.192 | 26.334 |
| 24.1965 | 26.334 |
| 24.201 | 26.34 |
| 24.2055 | 26.347 |
| 24.21 | 26.347 |
| 24.2145 | 26.354 |
| 24.219 | 26.354 |
| 24.2235 | 26.36 |
| 24.228 | 26.36 |
| 24.2325 | 26.367 |
| 24.237 | 26.367 |
| 24.2415 | 26.372 |
| 24.246 | 26.378 |
| 24.2505 | 26.378 |
| 24.255 | 26.384 |
| 24.2595 | 26.384 |
| 24.264 | 26.39 |
| 24.2685 | 26.39 |
| 24.273 | 26.396 |
| 24.2775 | 26.396 |
| 24.282 | 26.401 |
| 24.2865 | 26.407 |
| 24.291 | 26.407 |
| 24.2955 | 26.413 |
| 24.3 | 26.413 |
| 24.3045 | 26.419 |
| 24.309 | 26.419 |
| 24.3135 | 26.424 |
| 24.318 | 26.427 |
| 24.3225 | 26.43 |
| 24.327 | 26.436 |
| 24.3315 | 26.436 |
| 24.336 | 26.442 |
| 24.3405 | 26.442 |
| 24.345 | 26.447 |
| 24.3495 | 26.447 |
| 24.354 | 26.451 |
| 24.3585 | 26.455 |
| 24.363 | 26.455 |
| 24.3675 | 26.459 |
| 24.372 | 26.459 |
| 24.3765 | 26.462 |
| 24.381 | 26.462 |
| 24.3855 | 26.466 |
| 24.39 | 26.466 |
| 24.3945 | 26.47 |
| 24.399 | 26.474 |
| 24.4035 | 26.474 |
| 24.408 | 26.478 |
| 24.4125 | 26.478 |
| 24.417 | 26.482 |
| 24.4215 | 26.482 |
| 24.426 | 26.485 |
| 24.4305 | 26.485 |
| 24.435 | 26.489 |
| 24.4395 | 26.493 |
| 24.444 | 26.493 |
| 24.4485 | 26.497 |
| 24.453 | 26.497 |
| 24.4575 | 26.501 |
| 24.462 | 26.501 |
| 24.4665 | 26.505 |
| 24.471 | 26.507 |
| 24.4755 | 26.509 |
| 24.48 | 26.513 |
| 24.4845 | 26.513 |
| 24.489 | 26.518 |
| 24.4935 | 26.518 |
| 24.498 | 26.522 |
| 24.5025 | 26.522 |
| 24.507 | 26.526 |
| 24.5115 | 26.53 |
| 24.516 | 26.53 |
| 24.5205 | 26.535 |
| 24.525 | 26.535 |
| 24.5295 | 26.539 |
| 24.534 | 26.539 |
| 24.5385 | 26.543 |
| 24.543 | 26.543 |
| 24.5475 | 26.547 |
| 24.552 | 26.552 |
| 24.5565 | 26.552 |
| 24.561 | 26.556 |
| 24.5655 | 26.556 |
| 24.57 | 26.56 |
| 24.5745 | 26.56 |
| 24.579 | 26.565 |
| 24.5835 | 26.565 |
| 24.588 | 26.57 |
| 24.5925 | 26.575 |
| 24.597 | 26.575 |
| 24.6015 | 26.58 |
| 24.606 | 26.58 |
| 24.6105 | 26.585 |
| 24.615 | 26.585 |
| 24.6195 | 26.59 |
| 24.624 | 26.596 |
| 24.6285 | 26.596 |
| 24.633 | 26.601 |
| 24.6375 | 26.601 |
| 24.642 | 26.606 |
| 24.6465 | 26.606 |
| 24.651 | 26.611 |
| 24.6555 | 26.611 |
| 24.66 | 26.616 |
| 24.6645 | 26.621 |
| 24.669 | 26.621 |
| 24.6735 | 26.626 |
| 24.678 | 26.626 |
| 24.6825 | 26.631 |
| 24.687 | 26.631 |
| 24.6915 | 26.636 |
| 24.696 | 26.636 |
| 24.7005 | 26.639 |
| 24.705 | 26.642 |
| 24.7095 | 26.642 |
| 24.714 | 26.644 |
| 24.7185 | 26.644 |
| 24.723 | 26.647 |
| 24.7275 | 26.647 |
| 24.732 | 26.65 |
| 24.7365 | 26.65 |
| 24.741 | 26.652 |
| 24.7455 | 26.655 |
| 24.75 | 26.655 |
| 24.7545 | 26.657 |
| 24.759 | 26.657 |
| 24.7635 | 26.66 |
| 24.768 | 26.66 |
| 24.7725 | 26.662 |
| 24.777 | 26.665 |
| 24.7815 | 26.665 |
| 24.786 | 26.667 |
| 24.7905 | 26.667 |
| 24.795 | 26.67 |
| 24.7995 | 26.67 |
| 24.804 | 26.673 |
| 24.8085 | 26.673 |
| 24.813 | 26.674 |
| 24.8175 | 26.674 |
| 24.822 | 26.674 |
| 24.8265 | 26.674 |
| 24.831 | 26.674 |
| 24.8355 | 26.673 |
| 24.84 | 26.673 |
| 24.8445 | 26.673 |
| 24.849 | 26.673 |
| 24.8535 | 26.672 |
| 24.858 | 26.672 |
| 24.8625 | 26.672 |
| 24.867 | 26.672 |
| 24.8715 | 26.672 |
| 24.876 | 26.671 |
| 24.8805 | 26.671 |
| 24.885 | 26.671 |
| 24.8895 | 26.671 |
| 24.894 | 26.67 |
| 24.8985 | 26.67 |
| 24.903 | 26.67 |
| 24.9075 | 26.67 |
| 24.912 | 26.67 |
| 24.9165 | 26.669 |
| 24.921 | 26.669 |
| 24.9255 | 26.669 |
| 24.93 | 26.669 |
| 24.9345 | 26.669 |
| 24.939 | 26.67 |
| 24.9435 | 26.67 |
| 24.948 | 26.672 |
| 24.9525 | 26.672 |
| 24.957 | 26.673 |
| 24.9615 | 26.673 |
| 24.966 | 26.675 |